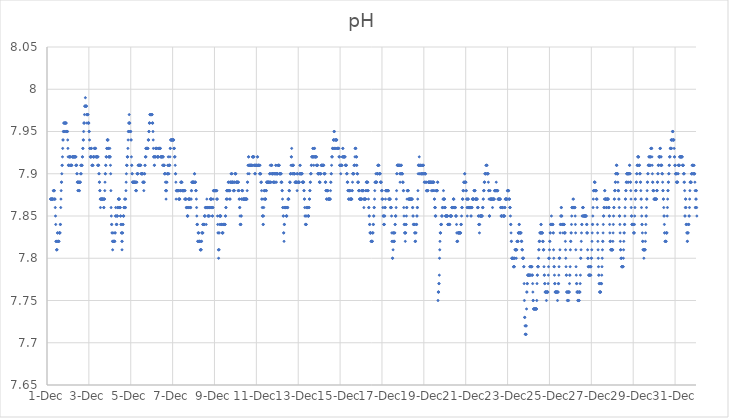
| Category | pH |
|---|---|
| 44896.166666666664 | 7.87 |
| 44896.177083333336 | 7.87 |
| 44896.1875 | 7.87 |
| 44896.197916666664 | 7.87 |
| 44896.208333333336 | 7.87 |
| 44896.21875 | 7.87 |
| 44896.229166666664 | 7.87 |
| 44896.239583333336 | 7.87 |
| 44896.25 | 7.87 |
| 44896.260416666664 | 7.87 |
| 44896.270833333336 | 7.87 |
| 44896.28125 | 7.87 |
| 44896.291666666664 | 7.87 |
| 44896.302083333336 | 7.88 |
| 44896.3125 | 7.88 |
| 44896.322916666664 | 7.88 |
| 44896.333333333336 | 7.87 |
| 44896.34375 | 7.88 |
| 44896.354166666664 | 7.88 |
| 44896.364583333336 | 7.87 |
| 44896.375 | 7.87 |
| 44896.385416666664 | 7.87 |
| 44896.395833333336 | 7.86 |
| 44896.40625 | 7.85 |
| 44896.416666666664 | 7.84 |
| 44896.427083333336 | 7.82 |
| 44896.4375 | 7.82 |
| 44896.447916666664 | 7.82 |
| 44896.458333333336 | 7.81 |
| 44896.46875 | 7.81 |
| 44896.479166666664 | 7.81 |
| 44896.489583333336 | 7.82 |
| 44896.5 | 7.83 |
| 44896.510416666664 | 7.83 |
| 44896.520833333336 | 7.82 |
| 44896.53125 | 7.82 |
| 44896.541666666664 | 7.82 |
| 44896.552083333336 | 7.82 |
| 44896.5625 | 7.82 |
| 44896.572916666664 | 7.82 |
| 44896.583333333336 | 7.83 |
| 44896.59375 | 7.83 |
| 44896.604166666664 | 7.83 |
| 44896.614583333336 | 7.83 |
| 44896.625 | 7.83 |
| 44896.635416666664 | 7.84 |
| 44896.645833333336 | 7.84 |
| 44896.65625 | 7.86 |
| 44896.666666666664 | 7.87 |
| 44896.677083333336 | 7.88 |
| 44896.6875 | 7.89 |
| 44896.697916666664 | 7.89 |
| 44896.708333333336 | 7.9 |
| 44896.71875 | 7.91 |
| 44896.729166666664 | 7.91 |
| 44896.739583333336 | 7.92 |
| 44896.75 | 7.93 |
| 44896.760416666664 | 7.94 |
| 44896.770833333336 | 7.94 |
| 44896.78125 | 7.95 |
| 44896.791666666664 | 7.95 |
| 44896.802083333336 | 7.96 |
| 44896.8125 | 7.96 |
| 44896.822916666664 | 7.96 |
| 44896.833333333336 | 7.96 |
| 44896.84375 | 7.95 |
| 44896.854166666664 | 7.96 |
| 44896.864583333336 | 7.95 |
| 44896.875 | 7.96 |
| 44896.885416666664 | 7.96 |
| 44896.895833333336 | 7.96 |
| 44896.90625 | 7.96 |
| 44896.916666666664 | 7.96 |
| 44896.927083333336 | 7.95 |
| 44896.9375 | 7.95 |
| 44896.947916666664 | 7.95 |
| 44896.958333333336 | 7.95 |
| 44896.96875 | 7.95 |
| 44896.979166666664 | 7.95 |
| 44896.989583333336 | 7.94 |
| 44897.0 | 7.93 |
| 44897.010416666664 | 7.92 |
| 44897.020833333336 | 7.91 |
| 44897.03125 | 7.91 |
| 44897.041666666664 | 7.91 |
| 44897.052083333336 | 7.92 |
| 44897.0625 | 7.91 |
| 44897.072916666664 | 7.92 |
| 44897.083333333336 | 7.92 |
| 44897.09375 | 7.92 |
| 44897.104166666664 | 7.92 |
| 44897.114583333336 | 7.92 |
| 44897.125 | 7.91 |
| 44897.135416666664 | 7.91 |
| 44897.145833333336 | 7.91 |
| 44897.15625 | 7.91 |
| 44897.166666666664 | 7.91 |
| 44897.177083333336 | 7.91 |
| 44897.1875 | 7.91 |
| 44897.197916666664 | 7.92 |
| 44897.208333333336 | 7.92 |
| 44897.21875 | 7.92 |
| 44897.229166666664 | 7.92 |
| 44897.239583333336 | 7.92 |
| 44897.25 | 7.92 |
| 44897.260416666664 | 7.92 |
| 44897.270833333336 | 7.92 |
| 44897.28125 | 7.92 |
| 44897.291666666664 | 7.92 |
| 44897.302083333336 | 7.92 |
| 44897.3125 | 7.92 |
| 44897.322916666664 | 7.92 |
| 44897.333333333336 | 7.92 |
| 44897.34375 | 7.92 |
| 44897.354166666664 | 7.92 |
| 44897.364583333336 | 7.92 |
| 44897.375 | 7.91 |
| 44897.385416666664 | 7.92 |
| 44897.395833333336 | 7.91 |
| 44897.40625 | 7.91 |
| 44897.416666666664 | 7.91 |
| 44897.427083333336 | 7.9 |
| 44897.4375 | 7.9 |
| 44897.447916666664 | 7.89 |
| 44897.458333333336 | 7.89 |
| 44897.46875 | 7.89 |
| 44897.479166666664 | 7.88 |
| 44897.489583333336 | 7.88 |
| 44897.5 | 7.89 |
| 44897.510416666664 | 7.89 |
| 44897.520833333336 | 7.89 |
| 44897.53125 | 7.88 |
| 44897.541666666664 | 7.89 |
| 44897.552083333336 | 7.88 |
| 44897.5625 | 7.89 |
| 44897.572916666664 | 7.89 |
| 44897.583333333336 | 7.89 |
| 44897.59375 | 7.89 |
| 44897.604166666664 | 7.9 |
| 44897.614583333336 | 7.91 |
| 44897.625 | 7.91 |
| 44897.635416666664 | 7.9 |
| 44897.645833333336 | 7.91 |
| 44897.65625 | 7.91 |
| 44897.666666666664 | 7.91 |
| 44897.677083333336 | 7.91 |
| 44897.6875 | 7.92 |
| 44897.697916666664 | 7.92 |
| 44897.708333333336 | 7.93 |
| 44897.71875 | 7.93 |
| 44897.729166666664 | 7.94 |
| 44897.739583333336 | 7.94 |
| 44897.75 | 7.95 |
| 44897.760416666664 | 7.96 |
| 44897.770833333336 | 7.96 |
| 44897.78125 | 7.96 |
| 44897.791666666664 | 7.97 |
| 44897.802083333336 | 7.98 |
| 44897.8125 | 7.98 |
| 44897.822916666664 | 7.98 |
| 44897.833333333336 | 7.99 |
| 44897.84375 | 7.98 |
| 44897.854166666664 | 7.98 |
| 44897.864583333336 | 7.98 |
| 44897.875 | 7.98 |
| 44897.885416666664 | 7.98 |
| 44897.895833333336 | 7.97 |
| 44897.90625 | 7.96 |
| 44897.916666666664 | 7.97 |
| 44897.927083333336 | 7.97 |
| 44897.9375 | 7.97 |
| 44897.947916666664 | 7.97 |
| 44897.958333333336 | 7.97 |
| 44897.96875 | 7.96 |
| 44897.979166666664 | 7.96 |
| 44897.989583333336 | 7.96 |
| 44898.0 | 7.96 |
| 44898.010416666664 | 7.95 |
| 44898.020833333336 | 7.95 |
| 44898.03125 | 7.94 |
| 44898.041666666664 | 7.93 |
| 44898.052083333336 | 7.93 |
| 44898.0625 | 7.92 |
| 44898.072916666664 | 7.92 |
| 44898.083333333336 | 7.92 |
| 44898.09375 | 7.92 |
| 44898.104166666664 | 7.92 |
| 44898.114583333336 | 7.93 |
| 44898.125 | 7.93 |
| 44898.135416666664 | 7.92 |
| 44898.145833333336 | 7.91 |
| 44898.15625 | 7.91 |
| 44898.166666666664 | 7.91 |
| 44898.177083333336 | 7.91 |
| 44898.1875 | 7.91 |
| 44898.197916666664 | 7.91 |
| 44898.208333333336 | 7.92 |
| 44898.21875 | 7.92 |
| 44898.229166666664 | 7.92 |
| 44898.239583333336 | 7.92 |
| 44898.25 | 7.92 |
| 44898.260416666664 | 7.93 |
| 44898.270833333336 | 7.93 |
| 44898.28125 | 7.93 |
| 44898.291666666664 | 7.93 |
| 44898.302083333336 | 7.93 |
| 44898.3125 | 7.93 |
| 44898.322916666664 | 7.93 |
| 44898.333333333336 | 7.92 |
| 44898.34375 | 7.92 |
| 44898.354166666664 | 7.92 |
| 44898.364583333336 | 7.92 |
| 44898.375 | 7.92 |
| 44898.385416666664 | 7.92 |
| 44898.395833333336 | 7.92 |
| 44898.40625 | 7.92 |
| 44898.416666666664 | 7.91 |
| 44898.427083333336 | 7.92 |
| 44898.4375 | 7.92 |
| 44898.447916666664 | 7.91 |
| 44898.458333333336 | 7.91 |
| 44898.46875 | 7.91 |
| 44898.479166666664 | 7.9 |
| 44898.489583333336 | 7.9 |
| 44898.5 | 7.89 |
| 44898.510416666664 | 7.89 |
| 44898.520833333336 | 7.88 |
| 44898.53125 | 7.88 |
| 44898.541666666664 | 7.87 |
| 44898.552083333336 | 7.86 |
| 44898.5625 | 7.87 |
| 44898.572916666664 | 7.87 |
| 44898.583333333336 | 7.87 |
| 44898.59375 | 7.87 |
| 44898.604166666664 | 7.87 |
| 44898.614583333336 | 7.87 |
| 44898.625 | 7.87 |
| 44898.635416666664 | 7.87 |
| 44898.645833333336 | 7.87 |
| 44898.65625 | 7.87 |
| 44898.666666666664 | 7.87 |
| 44898.677083333336 | 7.87 |
| 44898.6875 | 7.87 |
| 44898.697916666664 | 7.87 |
| 44898.708333333336 | 7.86 |
| 44898.71875 | 7.86 |
| 44898.729166666664 | 7.87 |
| 44898.739583333336 | 7.87 |
| 44898.75 | 7.87 |
| 44898.760416666664 | 7.88 |
| 44898.770833333336 | 7.89 |
| 44898.78125 | 7.9 |
| 44898.791666666664 | 7.9 |
| 44898.802083333336 | 7.91 |
| 44898.8125 | 7.91 |
| 44898.822916666664 | 7.92 |
| 44898.833333333336 | 7.92 |
| 44898.84375 | 7.92 |
| 44898.854166666664 | 7.93 |
| 44898.864583333336 | 7.93 |
| 44898.875 | 7.94 |
| 44898.885416666664 | 7.94 |
| 44898.895833333336 | 7.94 |
| 44898.90625 | 7.94 |
| 44898.916666666664 | 7.94 |
| 44898.927083333336 | 7.93 |
| 44898.9375 | 7.93 |
| 44898.947916666664 | 7.92 |
| 44898.958333333336 | 7.92 |
| 44898.96875 | 7.92 |
| 44898.979166666664 | 7.92 |
| 44898.989583333336 | 7.92 |
| 44899.0 | 7.93 |
| 44899.010416666664 | 7.92 |
| 44899.020833333336 | 7.92 |
| 44899.03125 | 7.91 |
| 44899.041666666664 | 7.9 |
| 44899.052083333336 | 7.88 |
| 44899.0625 | 7.86 |
| 44899.072916666664 | 7.85 |
| 44899.083333333336 | 7.84 |
| 44899.09375 | 7.84 |
| 44899.104166666664 | 7.83 |
| 44899.114583333336 | 7.83 |
| 44899.125 | 7.82 |
| 44899.135416666664 | 7.81 |
| 44899.145833333336 | 7.82 |
| 44899.15625 | 7.82 |
| 44899.166666666664 | 7.82 |
| 44899.177083333336 | 7.82 |
| 44899.1875 | 7.82 |
| 44899.197916666664 | 7.83 |
| 44899.208333333336 | 7.82 |
| 44899.21875 | 7.82 |
| 44899.229166666664 | 7.82 |
| 44899.239583333336 | 7.82 |
| 44899.25 | 7.83 |
| 44899.260416666664 | 7.83 |
| 44899.270833333336 | 7.85 |
| 44899.28125 | 7.86 |
| 44899.291666666664 | 7.85 |
| 44899.302083333336 | 7.85 |
| 44899.3125 | 7.84 |
| 44899.322916666664 | 7.84 |
| 44899.333333333336 | 7.84 |
| 44899.34375 | 7.85 |
| 44899.354166666664 | 7.85 |
| 44899.364583333336 | 7.85 |
| 44899.375 | 7.86 |
| 44899.385416666664 | 7.86 |
| 44899.395833333336 | 7.86 |
| 44899.40625 | 7.87 |
| 44899.416666666664 | 7.87 |
| 44899.427083333336 | 7.87 |
| 44899.4375 | 7.87 |
| 44899.447916666664 | 7.87 |
| 44899.458333333336 | 7.87 |
| 44899.46875 | 7.86 |
| 44899.479166666664 | 7.86 |
| 44899.489583333336 | 7.86 |
| 44899.5 | 7.86 |
| 44899.510416666664 | 7.85 |
| 44899.520833333336 | 7.85 |
| 44899.53125 | 7.84 |
| 44899.541666666664 | 7.84 |
| 44899.552083333336 | 7.83 |
| 44899.5625 | 7.83 |
| 44899.572916666664 | 7.82 |
| 44899.583333333336 | 7.81 |
| 44899.59375 | 7.82 |
| 44899.604166666664 | 7.83 |
| 44899.614583333336 | 7.83 |
| 44899.625 | 7.84 |
| 44899.635416666664 | 7.84 |
| 44899.645833333336 | 7.85 |
| 44899.65625 | 7.85 |
| 44899.666666666664 | 7.85 |
| 44899.677083333336 | 7.86 |
| 44899.6875 | 7.86 |
| 44899.697916666664 | 7.86 |
| 44899.708333333336 | 7.87 |
| 44899.71875 | 7.86 |
| 44899.729166666664 | 7.87 |
| 44899.739583333336 | 7.86 |
| 44899.75 | 7.86 |
| 44899.760416666664 | 7.87 |
| 44899.770833333336 | 7.88 |
| 44899.78125 | 7.89 |
| 44899.791666666664 | 7.9 |
| 44899.802083333336 | 7.91 |
| 44899.8125 | 7.91 |
| 44899.822916666664 | 7.91 |
| 44899.833333333336 | 7.92 |
| 44899.84375 | 7.92 |
| 44899.854166666664 | 7.92 |
| 44899.864583333336 | 7.93 |
| 44899.875 | 7.94 |
| 44899.885416666664 | 7.95 |
| 44899.895833333336 | 7.95 |
| 44899.90625 | 7.96 |
| 44899.916666666664 | 7.96 |
| 44899.927083333336 | 7.97 |
| 44899.9375 | 7.96 |
| 44899.947916666664 | 7.96 |
| 44899.958333333336 | 7.96 |
| 44899.96875 | 7.95 |
| 44899.979166666664 | 7.95 |
| 44899.989583333336 | 7.95 |
| 44900.0 | 7.95 |
| 44900.010416666664 | 7.94 |
| 44900.020833333336 | 7.94 |
| 44900.03125 | 7.92 |
| 44900.041666666664 | 7.91 |
| 44900.052083333336 | 7.91 |
| 44900.0625 | 7.9 |
| 44900.072916666664 | 7.9 |
| 44900.083333333336 | 7.89 |
| 44900.09375 | 7.89 |
| 44900.104166666664 | 7.89 |
| 44900.114583333336 | 7.89 |
| 44900.125 | 7.89 |
| 44900.135416666664 | 7.89 |
| 44900.145833333336 | 7.89 |
| 44900.15625 | 7.89 |
| 44900.166666666664 | 7.89 |
| 44900.177083333336 | 7.89 |
| 44900.1875 | 7.89 |
| 44900.197916666664 | 7.89 |
| 44900.208333333336 | 7.89 |
| 44900.21875 | 7.89 |
| 44900.229166666664 | 7.89 |
| 44900.239583333336 | 7.88 |
| 44900.25 | 7.88 |
| 44900.260416666664 | 7.88 |
| 44900.270833333336 | 7.88 |
| 44900.28125 | 7.89 |
| 44900.291666666664 | 7.89 |
| 44900.302083333336 | 7.9 |
| 44900.3125 | 7.9 |
| 44900.322916666664 | 7.9 |
| 44900.333333333336 | 7.9 |
| 44900.34375 | 7.9 |
| 44900.354166666664 | 7.91 |
| 44900.364583333336 | 7.91 |
| 44900.375 | 7.91 |
| 44900.385416666664 | 7.91 |
| 44900.395833333336 | 7.91 |
| 44900.40625 | 7.91 |
| 44900.416666666664 | 7.91 |
| 44900.427083333336 | 7.91 |
| 44900.4375 | 7.91 |
| 44900.447916666664 | 7.91 |
| 44900.458333333336 | 7.91 |
| 44900.46875 | 7.91 |
| 44900.479166666664 | 7.91 |
| 44900.489583333336 | 7.9 |
| 44900.5 | 7.9 |
| 44900.510416666664 | 7.9 |
| 44900.520833333336 | 7.9 |
| 44900.53125 | 7.9 |
| 44900.541666666664 | 7.9 |
| 44900.552083333336 | 7.9 |
| 44900.5625 | 7.9 |
| 44900.572916666664 | 7.89 |
| 44900.583333333336 | 7.9 |
| 44900.59375 | 7.89 |
| 44900.604166666664 | 7.89 |
| 44900.614583333336 | 7.89 |
| 44900.625 | 7.88 |
| 44900.635416666664 | 7.89 |
| 44900.645833333336 | 7.89 |
| 44900.65625 | 7.9 |
| 44900.666666666664 | 7.9 |
| 44900.677083333336 | 7.91 |
| 44900.6875 | 7.91 |
| 44900.697916666664 | 7.92 |
| 44900.708333333336 | 7.92 |
| 44900.71875 | 7.93 |
| 44900.729166666664 | 7.92 |
| 44900.739583333336 | 7.93 |
| 44900.75 | 7.93 |
| 44900.760416666664 | 7.93 |
| 44900.770833333336 | 7.93 |
| 44900.78125 | 7.93 |
| 44900.791666666664 | 7.93 |
| 44900.802083333336 | 7.93 |
| 44900.8125 | 7.93 |
| 44900.822916666664 | 7.93 |
| 44900.833333333336 | 7.94 |
| 44900.84375 | 7.94 |
| 44900.854166666664 | 7.94 |
| 44900.864583333336 | 7.95 |
| 44900.875 | 7.95 |
| 44900.885416666664 | 7.96 |
| 44900.895833333336 | 7.96 |
| 44900.90625 | 7.96 |
| 44900.916666666664 | 7.97 |
| 44900.927083333336 | 7.97 |
| 44900.9375 | 7.97 |
| 44900.947916666664 | 7.97 |
| 44900.958333333336 | 7.97 |
| 44900.96875 | 7.97 |
| 44900.979166666664 | 7.97 |
| 44900.989583333336 | 7.97 |
| 44901.0 | 7.97 |
| 44901.010416666664 | 7.97 |
| 44901.020833333336 | 7.97 |
| 44901.03125 | 7.96 |
| 44901.041666666664 | 7.96 |
| 44901.052083333336 | 7.96 |
| 44901.0625 | 7.95 |
| 44901.072916666664 | 7.94 |
| 44901.083333333336 | 7.93 |
| 44901.09375 | 7.92 |
| 44901.104166666664 | 7.92 |
| 44901.114583333336 | 7.92 |
| 44901.125 | 7.91 |
| 44901.135416666664 | 7.91 |
| 44901.145833333336 | 7.92 |
| 44901.15625 | 7.92 |
| 44901.166666666664 | 7.92 |
| 44901.177083333336 | 7.92 |
| 44901.1875 | 7.93 |
| 44901.197916666664 | 7.93 |
| 44901.208333333336 | 7.93 |
| 44901.21875 | 7.93 |
| 44901.229166666664 | 7.93 |
| 44901.239583333336 | 7.93 |
| 44901.25 | 7.93 |
| 44901.260416666664 | 7.92 |
| 44901.270833333336 | 7.92 |
| 44901.28125 | 7.92 |
| 44901.291666666664 | 7.92 |
| 44901.302083333336 | 7.92 |
| 44901.3125 | 7.92 |
| 44901.322916666664 | 7.92 |
| 44901.333333333336 | 7.93 |
| 44901.34375 | 7.93 |
| 44901.354166666664 | 7.93 |
| 44901.364583333336 | 7.93 |
| 44901.375 | 7.93 |
| 44901.385416666664 | 7.93 |
| 44901.395833333336 | 7.93 |
| 44901.40625 | 7.93 |
| 44901.416666666664 | 7.93 |
| 44901.427083333336 | 7.92 |
| 44901.4375 | 7.92 |
| 44901.447916666664 | 7.92 |
| 44901.458333333336 | 7.92 |
| 44901.46875 | 7.92 |
| 44901.479166666664 | 7.92 |
| 44901.489583333336 | 7.92 |
| 44901.5 | 7.92 |
| 44901.510416666664 | 7.92 |
| 44901.520833333336 | 7.91 |
| 44901.53125 | 7.92 |
| 44901.541666666664 | 7.92 |
| 44901.552083333336 | 7.92 |
| 44901.5625 | 7.91 |
| 44901.572916666664 | 7.91 |
| 44901.583333333336 | 7.91 |
| 44901.59375 | 7.91 |
| 44901.604166666664 | 7.91 |
| 44901.614583333336 | 7.9 |
| 44901.625 | 7.9 |
| 44901.635416666664 | 7.9 |
| 44901.645833333336 | 7.9 |
| 44901.65625 | 7.89 |
| 44901.666666666664 | 7.88 |
| 44901.677083333336 | 7.88 |
| 44901.6875 | 7.87 |
| 44901.697916666664 | 7.88 |
| 44901.708333333336 | 7.88 |
| 44901.71875 | 7.89 |
| 44901.729166666664 | 7.89 |
| 44901.739583333336 | 7.9 |
| 44901.75 | 7.9 |
| 44901.760416666664 | 7.9 |
| 44901.770833333336 | 7.91 |
| 44901.78125 | 7.91 |
| 44901.791666666664 | 7.92 |
| 44901.802083333336 | 7.9 |
| 44901.8125 | 7.91 |
| 44901.822916666664 | 7.9 |
| 44901.833333333336 | 7.91 |
| 44901.84375 | 7.91 |
| 44901.854166666664 | 7.91 |
| 44901.864583333336 | 7.91 |
| 44901.875 | 7.92 |
| 44901.885416666664 | 7.93 |
| 44901.895833333336 | 7.93 |
| 44901.90625 | 7.94 |
| 44901.916666666664 | 7.94 |
| 44901.927083333336 | 7.94 |
| 44901.9375 | 7.94 |
| 44901.947916666664 | 7.94 |
| 44901.958333333336 | 7.94 |
| 44901.96875 | 7.94 |
| 44901.979166666664 | 7.94 |
| 44901.989583333336 | 7.94 |
| 44902.0 | 7.94 |
| 44902.010416666664 | 7.94 |
| 44902.020833333336 | 7.94 |
| 44902.03125 | 7.94 |
| 44902.041666666664 | 7.94 |
| 44902.052083333336 | 7.94 |
| 44902.0625 | 7.93 |
| 44902.072916666664 | 7.93 |
| 44902.083333333336 | 7.93 |
| 44902.09375 | 7.92 |
| 44902.104166666664 | 7.92 |
| 44902.114583333336 | 7.92 |
| 44902.125 | 7.91 |
| 44902.135416666664 | 7.9 |
| 44902.145833333336 | 7.9 |
| 44902.15625 | 7.89 |
| 44902.166666666664 | 7.87 |
| 44902.177083333336 | 7.88 |
| 44902.1875 | 7.88 |
| 44902.197916666664 | 7.88 |
| 44902.208333333336 | 7.88 |
| 44902.21875 | 7.88 |
| 44902.229166666664 | 7.88 |
| 44902.239583333336 | 7.88 |
| 44902.25 | 7.88 |
| 44902.260416666664 | 7.88 |
| 44902.270833333336 | 7.88 |
| 44902.28125 | 7.88 |
| 44902.291666666664 | 7.87 |
| 44902.302083333336 | 7.87 |
| 44902.3125 | 7.87 |
| 44902.322916666664 | 7.87 |
| 44902.333333333336 | 7.87 |
| 44902.34375 | 7.87 |
| 44902.354166666664 | 7.88 |
| 44902.364583333336 | 7.88 |
| 44902.375 | 7.88 |
| 44902.385416666664 | 7.89 |
| 44902.395833333336 | 7.88 |
| 44902.40625 | 7.89 |
| 44902.416666666664 | 7.89 |
| 44902.427083333336 | 7.89 |
| 44902.4375 | 7.89 |
| 44902.447916666664 | 7.89 |
| 44902.458333333336 | 7.88 |
| 44902.46875 | 7.88 |
| 44902.479166666664 | 7.88 |
| 44902.489583333336 | 7.88 |
| 44902.5 | 7.88 |
| 44902.510416666664 | 7.88 |
| 44902.520833333336 | 7.88 |
| 44902.53125 | 7.88 |
| 44902.541666666664 | 7.88 |
| 44902.552083333336 | 7.88 |
| 44902.5625 | 7.88 |
| 44902.572916666664 | 7.87 |
| 44902.583333333336 | 7.88 |
| 44902.59375 | 7.88 |
| 44902.604166666664 | 7.87 |
| 44902.614583333336 | 7.87 |
| 44902.625 | 7.87 |
| 44902.635416666664 | 7.87 |
| 44902.645833333336 | 7.87 |
| 44902.65625 | 7.86 |
| 44902.666666666664 | 7.86 |
| 44902.677083333336 | 7.86 |
| 44902.6875 | 7.86 |
| 44902.697916666664 | 7.85 |
| 44902.708333333336 | 7.85 |
| 44902.71875 | 7.85 |
| 44902.729166666664 | 7.85 |
| 44902.739583333336 | 7.86 |
| 44902.75 | 7.87 |
| 44902.760416666664 | 7.86 |
| 44902.770833333336 | 7.87 |
| 44902.78125 | 7.87 |
| 44902.791666666664 | 7.87 |
| 44902.802083333336 | 7.87 |
| 44902.8125 | 7.87 |
| 44902.822916666664 | 7.87 |
| 44902.833333333336 | 7.86 |
| 44902.84375 | 7.86 |
| 44902.854166666664 | 7.86 |
| 44902.864583333336 | 7.86 |
| 44902.875 | 7.87 |
| 44902.885416666664 | 7.87 |
| 44902.895833333336 | 7.88 |
| 44902.90625 | 7.88 |
| 44902.916666666664 | 7.89 |
| 44902.927083333336 | 7.89 |
| 44902.9375 | 7.89 |
| 44902.947916666664 | 7.89 |
| 44902.958333333336 | 7.89 |
| 44902.96875 | 7.89 |
| 44902.979166666664 | 7.89 |
| 44902.989583333336 | 7.89 |
| 44903.0 | 7.89 |
| 44903.010416666664 | 7.89 |
| 44903.020833333336 | 7.89 |
| 44903.03125 | 7.89 |
| 44903.041666666664 | 7.9 |
| 44903.052083333336 | 7.9 |
| 44903.0625 | 7.89 |
| 44903.072916666664 | 7.89 |
| 44903.083333333336 | 7.89 |
| 44903.09375 | 7.89 |
| 44903.104166666664 | 7.88 |
| 44903.114583333336 | 7.88 |
| 44903.125 | 7.88 |
| 44903.135416666664 | 7.87 |
| 44903.145833333336 | 7.86 |
| 44903.15625 | 7.85 |
| 44903.166666666664 | 7.84 |
| 44903.177083333336 | 7.84 |
| 44903.1875 | 7.84 |
| 44903.197916666664 | 7.82 |
| 44903.208333333336 | 7.82 |
| 44903.21875 | 7.83 |
| 44903.229166666664 | 7.83 |
| 44903.239583333336 | 7.82 |
| 44903.25 | 7.83 |
| 44903.260416666664 | 7.82 |
| 44903.270833333336 | 7.82 |
| 44903.28125 | 7.82 |
| 44903.291666666664 | 7.82 |
| 44903.302083333336 | 7.82 |
| 44903.3125 | 7.82 |
| 44903.322916666664 | 7.81 |
| 44903.333333333336 | 7.81 |
| 44903.34375 | 7.81 |
| 44903.354166666664 | 7.81 |
| 44903.364583333336 | 7.81 |
| 44903.375 | 7.82 |
| 44903.385416666664 | 7.82 |
| 44903.395833333336 | 7.83 |
| 44903.40625 | 7.83 |
| 44903.416666666664 | 7.83 |
| 44903.427083333336 | 7.83 |
| 44903.4375 | 7.84 |
| 44903.447916666664 | 7.83 |
| 44903.458333333336 | 7.84 |
| 44903.46875 | 7.84 |
| 44903.479166666664 | 7.84 |
| 44903.489583333336 | 7.84 |
| 44903.5 | 7.84 |
| 44903.510416666664 | 7.84 |
| 44903.520833333336 | 7.85 |
| 44903.53125 | 7.85 |
| 44903.541666666664 | 7.85 |
| 44903.552083333336 | 7.85 |
| 44903.5625 | 7.86 |
| 44903.572916666664 | 7.86 |
| 44903.583333333336 | 7.86 |
| 44903.59375 | 7.86 |
| 44903.604166666664 | 7.84 |
| 44903.614583333336 | 7.86 |
| 44903.625 | 7.86 |
| 44903.635416666664 | 7.87 |
| 44903.645833333336 | 7.86 |
| 44903.65625 | 7.86 |
| 44903.666666666664 | 7.86 |
| 44903.677083333336 | 7.86 |
| 44903.6875 | 7.85 |
| 44903.697916666664 | 7.85 |
| 44903.708333333336 | 7.85 |
| 44903.71875 | 7.86 |
| 44903.729166666664 | 7.85 |
| 44903.739583333336 | 7.86 |
| 44903.75 | 7.86 |
| 44903.760416666664 | 7.85 |
| 44903.770833333336 | 7.86 |
| 44903.78125 | 7.86 |
| 44903.791666666664 | 7.86 |
| 44903.802083333336 | 7.87 |
| 44903.8125 | 7.87 |
| 44903.822916666664 | 7.87 |
| 44903.833333333336 | 7.87 |
| 44903.84375 | 7.87 |
| 44903.854166666664 | 7.87 |
| 44903.864583333336 | 7.86 |
| 44903.875 | 7.86 |
| 44903.885416666664 | 7.86 |
| 44903.895833333336 | 7.85 |
| 44903.90625 | 7.85 |
| 44903.916666666664 | 7.86 |
| 44903.927083333336 | 7.86 |
| 44903.9375 | 7.87 |
| 44903.947916666664 | 7.88 |
| 44903.958333333336 | 7.88 |
| 44903.96875 | 7.88 |
| 44903.979166666664 | 7.88 |
| 44903.989583333336 | 7.88 |
| 44904.0 | 7.88 |
| 44904.010416666664 | 7.88 |
| 44904.020833333336 | 7.88 |
| 44904.03125 | 7.88 |
| 44904.041666666664 | 7.88 |
| 44904.052083333336 | 7.88 |
| 44904.0625 | 7.88 |
| 44904.072916666664 | 7.88 |
| 44904.083333333336 | 7.88 |
| 44904.09375 | 7.88 |
| 44904.104166666664 | 7.87 |
| 44904.114583333336 | 7.88 |
| 44904.125 | 7.87 |
| 44904.135416666664 | 7.87 |
| 44904.145833333336 | 7.85 |
| 44904.15625 | 7.84 |
| 44904.166666666664 | 7.83 |
| 44904.177083333336 | 7.83 |
| 44904.1875 | 7.81 |
| 44904.197916666664 | 7.8 |
| 44904.208333333336 | 7.81 |
| 44904.21875 | 7.81 |
| 44904.229166666664 | 7.83 |
| 44904.239583333336 | 7.85 |
| 44904.25 | 7.84 |
| 44904.260416666664 | 7.85 |
| 44904.270833333336 | 7.85 |
| 44904.28125 | 7.85 |
| 44904.291666666664 | 7.85 |
| 44904.302083333336 | 7.85 |
| 44904.3125 | 7.84 |
| 44904.322916666664 | 7.84 |
| 44904.333333333336 | 7.84 |
| 44904.34375 | 7.84 |
| 44904.354166666664 | 7.84 |
| 44904.364583333336 | 7.83 |
| 44904.375 | 7.83 |
| 44904.385416666664 | 7.83 |
| 44904.395833333336 | 7.83 |
| 44904.40625 | 7.83 |
| 44904.416666666664 | 7.84 |
| 44904.427083333336 | 7.84 |
| 44904.4375 | 7.84 |
| 44904.447916666664 | 7.84 |
| 44904.458333333336 | 7.84 |
| 44904.46875 | 7.84 |
| 44904.479166666664 | 7.84 |
| 44904.489583333336 | 7.84 |
| 44904.5 | 7.84 |
| 44904.510416666664 | 7.84 |
| 44904.520833333336 | 7.85 |
| 44904.53125 | 7.85 |
| 44904.541666666664 | 7.86 |
| 44904.552083333336 | 7.86 |
| 44904.5625 | 7.87 |
| 44904.572916666664 | 7.87 |
| 44904.583333333336 | 7.88 |
| 44904.59375 | 7.88 |
| 44904.604166666664 | 7.88 |
| 44904.614583333336 | 7.88 |
| 44904.625 | 7.87 |
| 44904.635416666664 | 7.88 |
| 44904.645833333336 | 7.88 |
| 44904.65625 | 7.89 |
| 44904.666666666664 | 7.89 |
| 44904.677083333336 | 7.88 |
| 44904.6875 | 7.88 |
| 44904.697916666664 | 7.89 |
| 44904.708333333336 | 7.88 |
| 44904.71875 | 7.88 |
| 44904.729166666664 | 7.87 |
| 44904.739583333336 | 7.88 |
| 44904.75 | 7.87 |
| 44904.760416666664 | 7.89 |
| 44904.770833333336 | 7.89 |
| 44904.78125 | 7.89 |
| 44904.791666666664 | 7.9 |
| 44904.802083333336 | 7.89 |
| 44904.8125 | 7.89 |
| 44904.822916666664 | 7.9 |
| 44904.833333333336 | 7.9 |
| 44904.84375 | 7.89 |
| 44904.854166666664 | 7.89 |
| 44904.864583333336 | 7.89 |
| 44904.875 | 7.89 |
| 44904.885416666664 | 7.89 |
| 44904.895833333336 | 7.89 |
| 44904.90625 | 7.88 |
| 44904.916666666664 | 7.88 |
| 44904.927083333336 | 7.88 |
| 44904.9375 | 7.88 |
| 44904.947916666664 | 7.88 |
| 44904.958333333336 | 7.89 |
| 44904.96875 | 7.89 |
| 44904.979166666664 | 7.9 |
| 44904.989583333336 | 7.9 |
| 44905.0 | 7.9 |
| 44905.010416666664 | 7.9 |
| 44905.020833333336 | 7.9 |
| 44905.03125 | 7.89 |
| 44905.041666666664 | 7.89 |
| 44905.052083333336 | 7.89 |
| 44905.0625 | 7.89 |
| 44905.072916666664 | 7.89 |
| 44905.083333333336 | 7.89 |
| 44905.09375 | 7.89 |
| 44905.104166666664 | 7.89 |
| 44905.114583333336 | 7.89 |
| 44905.125 | 7.88 |
| 44905.135416666664 | 7.89 |
| 44905.145833333336 | 7.89 |
| 44905.15625 | 7.88 |
| 44905.166666666664 | 7.88 |
| 44905.177083333336 | 7.87 |
| 44905.1875 | 7.87 |
| 44905.197916666664 | 7.86 |
| 44905.208333333336 | 7.86 |
| 44905.21875 | 7.85 |
| 44905.229166666664 | 7.84 |
| 44905.239583333336 | 7.84 |
| 44905.25 | 7.84 |
| 44905.260416666664 | 7.84 |
| 44905.270833333336 | 7.85 |
| 44905.28125 | 7.85 |
| 44905.291666666664 | 7.87 |
| 44905.302083333336 | 7.87 |
| 44905.3125 | 7.88 |
| 44905.322916666664 | 7.88 |
| 44905.333333333336 | 7.88 |
| 44905.34375 | 7.88 |
| 44905.354166666664 | 7.87 |
| 44905.364583333336 | 7.87 |
| 44905.375 | 7.87 |
| 44905.385416666664 | 7.87 |
| 44905.395833333336 | 7.87 |
| 44905.40625 | 7.87 |
| 44905.416666666664 | 7.87 |
| 44905.427083333336 | 7.87 |
| 44905.4375 | 7.87 |
| 44905.447916666664 | 7.87 |
| 44905.458333333336 | 7.87 |
| 44905.46875 | 7.87 |
| 44905.479166666664 | 7.87 |
| 44905.489583333336 | 7.87 |
| 44905.5 | 7.87 |
| 44905.510416666664 | 7.87 |
| 44905.520833333336 | 7.87 |
| 44905.53125 | 7.87 |
| 44905.541666666664 | 7.87 |
| 44905.552083333336 | 7.87 |
| 44905.5625 | 7.88 |
| 44905.572916666664 | 7.89 |
| 44905.583333333336 | 7.89 |
| 44905.59375 | 7.9 |
| 44905.604166666664 | 7.91 |
| 44905.614583333336 | 7.91 |
| 44905.625 | 7.92 |
| 44905.635416666664 | 7.92 |
| 44905.645833333336 | 7.91 |
| 44905.65625 | 7.9 |
| 44905.666666666664 | 7.91 |
| 44905.677083333336 | 7.91 |
| 44905.6875 | 7.91 |
| 44905.697916666664 | 7.91 |
| 44905.708333333336 | 7.91 |
| 44905.71875 | 7.91 |
| 44905.729166666664 | 7.91 |
| 44905.739583333336 | 7.91 |
| 44905.75 | 7.91 |
| 44905.760416666664 | 7.91 |
| 44905.770833333336 | 7.91 |
| 44905.78125 | 7.91 |
| 44905.791666666664 | 7.91 |
| 44905.802083333336 | 7.91 |
| 44905.8125 | 7.92 |
| 44905.822916666664 | 7.92 |
| 44905.833333333336 | 7.92 |
| 44905.84375 | 7.91 |
| 44905.854166666664 | 7.92 |
| 44905.864583333336 | 7.92 |
| 44905.875 | 7.92 |
| 44905.885416666664 | 7.92 |
| 44905.895833333336 | 7.91 |
| 44905.90625 | 7.91 |
| 44905.916666666664 | 7.91 |
| 44905.927083333336 | 7.9 |
| 44905.9375 | 7.9 |
| 44905.947916666664 | 7.9 |
| 44905.958333333336 | 7.91 |
| 44905.96875 | 7.91 |
| 44905.979166666664 | 7.91 |
| 44905.989583333336 | 7.91 |
| 44906.0 | 7.91 |
| 44906.010416666664 | 7.91 |
| 44906.020833333336 | 7.91 |
| 44906.03125 | 7.91 |
| 44906.041666666664 | 7.91 |
| 44906.052083333336 | 7.92 |
| 44906.0625 | 7.92 |
| 44906.072916666664 | 7.91 |
| 44906.083333333336 | 7.91 |
| 44906.09375 | 7.91 |
| 44906.104166666664 | 7.91 |
| 44906.114583333336 | 7.91 |
| 44906.125 | 7.91 |
| 44906.135416666664 | 7.91 |
| 44906.145833333336 | 7.91 |
| 44906.15625 | 7.9 |
| 44906.166666666664 | 7.9 |
| 44906.177083333336 | 7.91 |
| 44906.1875 | 7.9 |
| 44906.197916666664 | 7.9 |
| 44906.208333333336 | 7.9 |
| 44906.21875 | 7.89 |
| 44906.229166666664 | 7.89 |
| 44906.239583333336 | 7.89 |
| 44906.25 | 7.88 |
| 44906.260416666664 | 7.87 |
| 44906.270833333336 | 7.87 |
| 44906.28125 | 7.86 |
| 44906.291666666664 | 7.85 |
| 44906.302083333336 | 7.85 |
| 44906.3125 | 7.85 |
| 44906.322916666664 | 7.84 |
| 44906.333333333336 | 7.84 |
| 44906.34375 | 7.85 |
| 44906.354166666664 | 7.86 |
| 44906.364583333336 | 7.87 |
| 44906.375 | 7.88 |
| 44906.385416666664 | 7.88 |
| 44906.395833333336 | 7.88 |
| 44906.40625 | 7.87 |
| 44906.416666666664 | 7.87 |
| 44906.427083333336 | 7.87 |
| 44906.4375 | 7.87 |
| 44906.447916666664 | 7.87 |
| 44906.458333333336 | 7.88 |
| 44906.46875 | 7.88 |
| 44906.479166666664 | 7.88 |
| 44906.489583333336 | 7.89 |
| 44906.5 | 7.89 |
| 44906.510416666664 | 7.89 |
| 44906.520833333336 | 7.89 |
| 44906.53125 | 7.89 |
| 44906.541666666664 | 7.89 |
| 44906.552083333336 | 7.89 |
| 44906.5625 | 7.89 |
| 44906.572916666664 | 7.89 |
| 44906.583333333336 | 7.89 |
| 44906.59375 | 7.89 |
| 44906.604166666664 | 7.89 |
| 44906.614583333336 | 7.89 |
| 44906.625 | 7.89 |
| 44906.635416666664 | 7.9 |
| 44906.645833333336 | 7.9 |
| 44906.65625 | 7.9 |
| 44906.666666666664 | 7.91 |
| 44906.677083333336 | 7.89 |
| 44906.6875 | 7.89 |
| 44906.697916666664 | 7.89 |
| 44906.708333333336 | 7.9 |
| 44906.71875 | 7.91 |
| 44906.729166666664 | 7.91 |
| 44906.739583333336 | 7.91 |
| 44906.75 | 7.9 |
| 44906.760416666664 | 7.9 |
| 44906.770833333336 | 7.9 |
| 44906.78125 | 7.9 |
| 44906.791666666664 | 7.9 |
| 44906.802083333336 | 7.89 |
| 44906.8125 | 7.89 |
| 44906.822916666664 | 7.89 |
| 44906.833333333336 | 7.9 |
| 44906.84375 | 7.9 |
| 44906.854166666664 | 7.9 |
| 44906.864583333336 | 7.89 |
| 44906.875 | 7.9 |
| 44906.885416666664 | 7.89 |
| 44906.895833333336 | 7.89 |
| 44906.90625 | 7.9 |
| 44906.916666666664 | 7.9 |
| 44906.927083333336 | 7.91 |
| 44906.9375 | 7.91 |
| 44906.947916666664 | 7.9 |
| 44906.958333333336 | 7.89 |
| 44906.96875 | 7.9 |
| 44906.979166666664 | 7.9 |
| 44906.989583333336 | 7.9 |
| 44907.0 | 7.9 |
| 44907.010416666664 | 7.9 |
| 44907.020833333336 | 7.9 |
| 44907.03125 | 7.91 |
| 44907.041666666664 | 7.91 |
| 44907.052083333336 | 7.91 |
| 44907.0625 | 7.91 |
| 44907.072916666664 | 7.91 |
| 44907.083333333336 | 7.91 |
| 44907.09375 | 7.91 |
| 44907.104166666664 | 7.9 |
| 44907.114583333336 | 7.9 |
| 44907.125 | 7.9 |
| 44907.135416666664 | 7.9 |
| 44907.145833333336 | 7.9 |
| 44907.15625 | 7.9 |
| 44907.166666666664 | 7.9 |
| 44907.177083333336 | 7.89 |
| 44907.1875 | 7.9 |
| 44907.197916666664 | 7.89 |
| 44907.208333333336 | 7.89 |
| 44907.21875 | 7.89 |
| 44907.229166666664 | 7.88 |
| 44907.239583333336 | 7.88 |
| 44907.25 | 7.87 |
| 44907.260416666664 | 7.86 |
| 44907.270833333336 | 7.86 |
| 44907.28125 | 7.85 |
| 44907.291666666664 | 7.85 |
| 44907.302083333336 | 7.83 |
| 44907.3125 | 7.83 |
| 44907.322916666664 | 7.82 |
| 44907.333333333336 | 7.84 |
| 44907.34375 | 7.84 |
| 44907.354166666664 | 7.86 |
| 44907.364583333336 | 7.86 |
| 44907.375 | 7.86 |
| 44907.385416666664 | 7.86 |
| 44907.395833333336 | 7.86 |
| 44907.40625 | 7.86 |
| 44907.416666666664 | 7.86 |
| 44907.427083333336 | 7.85 |
| 44907.4375 | 7.85 |
| 44907.447916666664 | 7.85 |
| 44907.458333333336 | 7.85 |
| 44907.46875 | 7.86 |
| 44907.479166666664 | 7.86 |
| 44907.489583333336 | 7.86 |
| 44907.5 | 7.86 |
| 44907.510416666664 | 7.87 |
| 44907.520833333336 | 7.87 |
| 44907.53125 | 7.87 |
| 44907.541666666664 | 7.87 |
| 44907.552083333336 | 7.87 |
| 44907.5625 | 7.88 |
| 44907.572916666664 | 7.88 |
| 44907.583333333336 | 7.88 |
| 44907.59375 | 7.89 |
| 44907.604166666664 | 7.89 |
| 44907.614583333336 | 7.89 |
| 44907.625 | 7.9 |
| 44907.635416666664 | 7.9 |
| 44907.645833333336 | 7.9 |
| 44907.65625 | 7.91 |
| 44907.666666666664 | 7.92 |
| 44907.677083333336 | 7.92 |
| 44907.6875 | 7.93 |
| 44907.697916666664 | 7.91 |
| 44907.708333333336 | 7.9 |
| 44907.71875 | 7.9 |
| 44907.729166666664 | 7.91 |
| 44907.739583333336 | 7.91 |
| 44907.75 | 7.91 |
| 44907.760416666664 | 7.91 |
| 44907.770833333336 | 7.91 |
| 44907.78125 | 7.9 |
| 44907.791666666664 | 7.9 |
| 44907.802083333336 | 7.9 |
| 44907.8125 | 7.9 |
| 44907.822916666664 | 7.9 |
| 44907.833333333336 | 7.9 |
| 44907.84375 | 7.89 |
| 44907.854166666664 | 7.89 |
| 44907.864583333336 | 7.89 |
| 44907.875 | 7.89 |
| 44907.885416666664 | 7.89 |
| 44907.895833333336 | 7.89 |
| 44907.90625 | 7.89 |
| 44907.916666666664 | 7.89 |
| 44907.927083333336 | 7.89 |
| 44907.9375 | 7.9 |
| 44907.947916666664 | 7.88 |
| 44907.958333333336 | 7.9 |
| 44907.96875 | 7.9 |
| 44907.979166666664 | 7.89 |
| 44907.989583333336 | 7.89 |
| 44908.0 | 7.89 |
| 44908.010416666664 | 7.89 |
| 44908.020833333336 | 7.89 |
| 44908.03125 | 7.89 |
| 44908.041666666664 | 7.89 |
| 44908.052083333336 | 7.89 |
| 44908.0625 | 7.9 |
| 44908.072916666664 | 7.9 |
| 44908.083333333336 | 7.91 |
| 44908.09375 | 7.91 |
| 44908.104166666664 | 7.9 |
| 44908.114583333336 | 7.9 |
| 44908.125 | 7.9 |
| 44908.135416666664 | 7.9 |
| 44908.145833333336 | 7.9 |
| 44908.15625 | 7.9 |
| 44908.166666666664 | 7.9 |
| 44908.177083333336 | 7.9 |
| 44908.1875 | 7.9 |
| 44908.197916666664 | 7.89 |
| 44908.208333333336 | 7.89 |
| 44908.21875 | 7.89 |
| 44908.229166666664 | 7.89 |
| 44908.239583333336 | 7.89 |
| 44908.25 | 7.89 |
| 44908.260416666664 | 7.89 |
| 44908.270833333336 | 7.88 |
| 44908.28125 | 7.88 |
| 44908.291666666664 | 7.87 |
| 44908.302083333336 | 7.87 |
| 44908.3125 | 7.86 |
| 44908.322916666664 | 7.85 |
| 44908.333333333336 | 7.85 |
| 44908.34375 | 7.84 |
| 44908.354166666664 | 7.84 |
| 44908.364583333336 | 7.84 |
| 44908.375 | 7.84 |
| 44908.385416666664 | 7.84 |
| 44908.395833333336 | 7.86 |
| 44908.40625 | 7.85 |
| 44908.416666666664 | 7.86 |
| 44908.427083333336 | 7.86 |
| 44908.4375 | 7.86 |
| 44908.447916666664 | 7.86 |
| 44908.458333333336 | 7.86 |
| 44908.46875 | 7.85 |
| 44908.479166666664 | 7.85 |
| 44908.489583333336 | 7.85 |
| 44908.5 | 7.85 |
| 44908.510416666664 | 7.86 |
| 44908.520833333336 | 7.86 |
| 44908.53125 | 7.87 |
| 44908.541666666664 | 7.87 |
| 44908.552083333336 | 7.88 |
| 44908.5625 | 7.88 |
| 44908.572916666664 | 7.89 |
| 44908.583333333336 | 7.89 |
| 44908.59375 | 7.9 |
| 44908.604166666664 | 7.9 |
| 44908.614583333336 | 7.9 |
| 44908.625 | 7.91 |
| 44908.635416666664 | 7.91 |
| 44908.645833333336 | 7.92 |
| 44908.65625 | 7.92 |
| 44908.666666666664 | 7.92 |
| 44908.677083333336 | 7.92 |
| 44908.6875 | 7.92 |
| 44908.697916666664 | 7.93 |
| 44908.708333333336 | 7.93 |
| 44908.71875 | 7.92 |
| 44908.729166666664 | 7.92 |
| 44908.739583333336 | 7.91 |
| 44908.75 | 7.92 |
| 44908.760416666664 | 7.92 |
| 44908.770833333336 | 7.93 |
| 44908.78125 | 7.93 |
| 44908.791666666664 | 7.92 |
| 44908.802083333336 | 7.92 |
| 44908.8125 | 7.92 |
| 44908.822916666664 | 7.92 |
| 44908.833333333336 | 7.92 |
| 44908.84375 | 7.92 |
| 44908.854166666664 | 7.92 |
| 44908.864583333336 | 7.91 |
| 44908.875 | 7.92 |
| 44908.885416666664 | 7.91 |
| 44908.895833333336 | 7.91 |
| 44908.90625 | 7.91 |
| 44908.916666666664 | 7.91 |
| 44908.927083333336 | 7.91 |
| 44908.9375 | 7.9 |
| 44908.947916666664 | 7.9 |
| 44908.958333333336 | 7.9 |
| 44908.96875 | 7.9 |
| 44908.979166666664 | 7.9 |
| 44908.989583333336 | 7.9 |
| 44909.0 | 7.9 |
| 44909.010416666664 | 7.89 |
| 44909.020833333336 | 7.89 |
| 44909.03125 | 7.89 |
| 44909.041666666664 | 7.89 |
| 44909.052083333336 | 7.9 |
| 44909.0625 | 7.9 |
| 44909.072916666664 | 7.9 |
| 44909.083333333336 | 7.9 |
| 44909.09375 | 7.91 |
| 44909.104166666664 | 7.91 |
| 44909.114583333336 | 7.91 |
| 44909.125 | 7.91 |
| 44909.135416666664 | 7.91 |
| 44909.145833333336 | 7.91 |
| 44909.15625 | 7.91 |
| 44909.166666666664 | 7.91 |
| 44909.177083333336 | 7.91 |
| 44909.1875 | 7.91 |
| 44909.197916666664 | 7.91 |
| 44909.208333333336 | 7.91 |
| 44909.21875 | 7.91 |
| 44909.229166666664 | 7.9 |
| 44909.239583333336 | 7.9 |
| 44909.25 | 7.9 |
| 44909.260416666664 | 7.9 |
| 44909.270833333336 | 7.9 |
| 44909.28125 | 7.9 |
| 44909.291666666664 | 7.89 |
| 44909.302083333336 | 7.89 |
| 44909.3125 | 7.89 |
| 44909.322916666664 | 7.88 |
| 44909.333333333336 | 7.88 |
| 44909.34375 | 7.88 |
| 44909.354166666664 | 7.87 |
| 44909.364583333336 | 7.87 |
| 44909.375 | 7.87 |
| 44909.385416666664 | 7.88 |
| 44909.395833333336 | 7.88 |
| 44909.40625 | 7.88 |
| 44909.416666666664 | 7.88 |
| 44909.427083333336 | 7.87 |
| 44909.4375 | 7.87 |
| 44909.447916666664 | 7.87 |
| 44909.458333333336 | 7.87 |
| 44909.46875 | 7.87 |
| 44909.479166666664 | 7.87 |
| 44909.489583333336 | 7.87 |
| 44909.5 | 7.87 |
| 44909.510416666664 | 7.87 |
| 44909.520833333336 | 7.87 |
| 44909.53125 | 7.87 |
| 44909.541666666664 | 7.88 |
| 44909.552083333336 | 7.89 |
| 44909.5625 | 7.89 |
| 44909.572916666664 | 7.9 |
| 44909.583333333336 | 7.9 |
| 44909.59375 | 7.91 |
| 44909.604166666664 | 7.92 |
| 44909.614583333336 | 7.92 |
| 44909.625 | 7.92 |
| 44909.635416666664 | 7.93 |
| 44909.645833333336 | 7.93 |
| 44909.65625 | 7.93 |
| 44909.666666666664 | 7.93 |
| 44909.677083333336 | 7.94 |
| 44909.6875 | 7.94 |
| 44909.697916666664 | 7.94 |
| 44909.708333333336 | 7.95 |
| 44909.71875 | 7.94 |
| 44909.729166666664 | 7.95 |
| 44909.739583333336 | 7.93 |
| 44909.75 | 7.93 |
| 44909.760416666664 | 7.94 |
| 44909.770833333336 | 7.94 |
| 44909.78125 | 7.94 |
| 44909.791666666664 | 7.93 |
| 44909.802083333336 | 7.94 |
| 44909.8125 | 7.94 |
| 44909.822916666664 | 7.94 |
| 44909.833333333336 | 7.94 |
| 44909.84375 | 7.94 |
| 44909.854166666664 | 7.93 |
| 44909.864583333336 | 7.93 |
| 44909.875 | 7.93 |
| 44909.885416666664 | 7.93 |
| 44909.895833333336 | 7.93 |
| 44909.90625 | 7.93 |
| 44909.916666666664 | 7.93 |
| 44909.927083333336 | 7.93 |
| 44909.9375 | 7.93 |
| 44909.947916666664 | 7.92 |
| 44909.958333333336 | 7.92 |
| 44909.96875 | 7.92 |
| 44909.979166666664 | 7.91 |
| 44909.989583333336 | 7.91 |
| 44910.0 | 7.91 |
| 44910.010416666664 | 7.91 |
| 44910.020833333336 | 7.91 |
| 44910.03125 | 7.9 |
| 44910.041666666664 | 7.91 |
| 44910.052083333336 | 7.91 |
| 44910.0625 | 7.91 |
| 44910.072916666664 | 7.91 |
| 44910.083333333336 | 7.91 |
| 44910.09375 | 7.91 |
| 44910.104166666664 | 7.92 |
| 44910.114583333336 | 7.92 |
| 44910.125 | 7.93 |
| 44910.135416666664 | 7.93 |
| 44910.145833333336 | 7.92 |
| 44910.15625 | 7.92 |
| 44910.166666666664 | 7.92 |
| 44910.177083333336 | 7.92 |
| 44910.1875 | 7.92 |
| 44910.197916666664 | 7.92 |
| 44910.208333333336 | 7.92 |
| 44910.21875 | 7.92 |
| 44910.229166666664 | 7.92 |
| 44910.239583333336 | 7.92 |
| 44910.25 | 7.91 |
| 44910.260416666664 | 7.91 |
| 44910.270833333336 | 7.91 |
| 44910.28125 | 7.91 |
| 44910.291666666664 | 7.91 |
| 44910.302083333336 | 7.91 |
| 44910.3125 | 7.9 |
| 44910.322916666664 | 7.9 |
| 44910.333333333336 | 7.9 |
| 44910.34375 | 7.89 |
| 44910.354166666664 | 7.89 |
| 44910.364583333336 | 7.89 |
| 44910.375 | 7.88 |
| 44910.385416666664 | 7.88 |
| 44910.395833333336 | 7.88 |
| 44910.40625 | 7.87 |
| 44910.416666666664 | 7.87 |
| 44910.427083333336 | 7.87 |
| 44910.4375 | 7.88 |
| 44910.447916666664 | 7.88 |
| 44910.458333333336 | 7.88 |
| 44910.46875 | 7.87 |
| 44910.479166666664 | 7.88 |
| 44910.489583333336 | 7.87 |
| 44910.5 | 7.87 |
| 44910.510416666664 | 7.87 |
| 44910.520833333336 | 7.87 |
| 44910.53125 | 7.87 |
| 44910.541666666664 | 7.87 |
| 44910.552083333336 | 7.87 |
| 44910.5625 | 7.87 |
| 44910.572916666664 | 7.88 |
| 44910.583333333336 | 7.88 |
| 44910.59375 | 7.89 |
| 44910.604166666664 | 7.9 |
| 44910.614583333336 | 7.9 |
| 44910.625 | 7.9 |
| 44910.635416666664 | 7.9 |
| 44910.645833333336 | 7.9 |
| 44910.65625 | 7.9 |
| 44910.666666666664 | 7.91 |
| 44910.677083333336 | 7.91 |
| 44910.6875 | 7.91 |
| 44910.697916666664 | 7.91 |
| 44910.708333333336 | 7.92 |
| 44910.71875 | 7.93 |
| 44910.729166666664 | 7.93 |
| 44910.739583333336 | 7.93 |
| 44910.75 | 7.93 |
| 44910.760416666664 | 7.92 |
| 44910.770833333336 | 7.92 |
| 44910.78125 | 7.91 |
| 44910.791666666664 | 7.92 |
| 44910.802083333336 | 7.91 |
| 44910.8125 | 7.9 |
| 44910.822916666664 | 7.9 |
| 44910.833333333336 | 7.9 |
| 44910.84375 | 7.89 |
| 44910.854166666664 | 7.89 |
| 44910.864583333336 | 7.89 |
| 44910.875 | 7.89 |
| 44910.885416666664 | 7.88 |
| 44910.895833333336 | 7.88 |
| 44910.90625 | 7.88 |
| 44910.916666666664 | 7.88 |
| 44910.927083333336 | 7.87 |
| 44910.9375 | 7.87 |
| 44910.947916666664 | 7.87 |
| 44910.958333333336 | 7.87 |
| 44910.96875 | 7.87 |
| 44910.979166666664 | 7.87 |
| 44910.989583333336 | 7.87 |
| 44911.0 | 7.87 |
| 44911.010416666664 | 7.87 |
| 44911.020833333336 | 7.88 |
| 44911.03125 | 7.87 |
| 44911.041666666664 | 7.87 |
| 44911.052083333336 | 7.88 |
| 44911.0625 | 7.88 |
| 44911.072916666664 | 7.88 |
| 44911.083333333336 | 7.88 |
| 44911.09375 | 7.88 |
| 44911.104166666664 | 7.88 |
| 44911.114583333336 | 7.88 |
| 44911.125 | 7.87 |
| 44911.135416666664 | 7.86 |
| 44911.145833333336 | 7.87 |
| 44911.15625 | 7.87 |
| 44911.166666666664 | 7.87 |
| 44911.177083333336 | 7.87 |
| 44911.1875 | 7.87 |
| 44911.197916666664 | 7.87 |
| 44911.208333333336 | 7.87 |
| 44911.21875 | 7.87 |
| 44911.229166666664 | 7.88 |
| 44911.239583333336 | 7.88 |
| 44911.25 | 7.89 |
| 44911.260416666664 | 7.89 |
| 44911.270833333336 | 7.89 |
| 44911.28125 | 7.89 |
| 44911.291666666664 | 7.89 |
| 44911.302083333336 | 7.88 |
| 44911.3125 | 7.89 |
| 44911.322916666664 | 7.89 |
| 44911.333333333336 | 7.88 |
| 44911.34375 | 7.88 |
| 44911.354166666664 | 7.87 |
| 44911.364583333336 | 7.86 |
| 44911.375 | 7.86 |
| 44911.385416666664 | 7.85 |
| 44911.395833333336 | 7.85 |
| 44911.40625 | 7.84 |
| 44911.416666666664 | 7.84 |
| 44911.427083333336 | 7.83 |
| 44911.4375 | 7.83 |
| 44911.447916666664 | 7.83 |
| 44911.458333333336 | 7.83 |
| 44911.46875 | 7.83 |
| 44911.479166666664 | 7.82 |
| 44911.489583333336 | 7.82 |
| 44911.5 | 7.82 |
| 44911.510416666664 | 7.82 |
| 44911.520833333336 | 7.82 |
| 44911.53125 | 7.82 |
| 44911.541666666664 | 7.82 |
| 44911.552083333336 | 7.83 |
| 44911.5625 | 7.83 |
| 44911.572916666664 | 7.83 |
| 44911.583333333336 | 7.84 |
| 44911.59375 | 7.84 |
| 44911.604166666664 | 7.85 |
| 44911.614583333336 | 7.85 |
| 44911.625 | 7.86 |
| 44911.635416666664 | 7.86 |
| 44911.645833333336 | 7.87 |
| 44911.65625 | 7.88 |
| 44911.666666666664 | 7.89 |
| 44911.677083333336 | 7.89 |
| 44911.6875 | 7.89 |
| 44911.697916666664 | 7.89 |
| 44911.708333333336 | 7.9 |
| 44911.71875 | 7.89 |
| 44911.729166666664 | 7.89 |
| 44911.739583333336 | 7.89 |
| 44911.75 | 7.89 |
| 44911.760416666664 | 7.9 |
| 44911.770833333336 | 7.9 |
| 44911.78125 | 7.9 |
| 44911.791666666664 | 7.9 |
| 44911.802083333336 | 7.91 |
| 44911.8125 | 7.91 |
| 44911.822916666664 | 7.91 |
| 44911.833333333336 | 7.91 |
| 44911.84375 | 7.91 |
| 44911.854166666664 | 7.91 |
| 44911.864583333336 | 7.9 |
| 44911.875 | 7.9 |
| 44911.885416666664 | 7.9 |
| 44911.895833333336 | 7.9 |
| 44911.90625 | 7.9 |
| 44911.916666666664 | 7.9 |
| 44911.927083333336 | 7.89 |
| 44911.9375 | 7.89 |
| 44911.947916666664 | 7.89 |
| 44911.958333333336 | 7.89 |
| 44911.96875 | 7.89 |
| 44911.979166666664 | 7.88 |
| 44911.989583333336 | 7.88 |
| 44912.0 | 7.87 |
| 44912.010416666664 | 7.88 |
| 44912.020833333336 | 7.87 |
| 44912.03125 | 7.87 |
| 44912.041666666664 | 7.86 |
| 44912.052083333336 | 7.85 |
| 44912.0625 | 7.85 |
| 44912.072916666664 | 7.85 |
| 44912.083333333336 | 7.84 |
| 44912.09375 | 7.84 |
| 44912.104166666664 | 7.84 |
| 44912.114583333336 | 7.84 |
| 44912.125 | 7.85 |
| 44912.135416666664 | 7.85 |
| 44912.145833333336 | 7.86 |
| 44912.15625 | 7.86 |
| 44912.166666666664 | 7.87 |
| 44912.177083333336 | 7.88 |
| 44912.1875 | 7.88 |
| 44912.197916666664 | 7.88 |
| 44912.208333333336 | 7.88 |
| 44912.21875 | 7.88 |
| 44912.229166666664 | 7.88 |
| 44912.239583333336 | 7.88 |
| 44912.25 | 7.88 |
| 44912.260416666664 | 7.88 |
| 44912.270833333336 | 7.88 |
| 44912.28125 | 7.88 |
| 44912.291666666664 | 7.88 |
| 44912.302083333336 | 7.88 |
| 44912.3125 | 7.88 |
| 44912.322916666664 | 7.87 |
| 44912.333333333336 | 7.87 |
| 44912.34375 | 7.87 |
| 44912.354166666664 | 7.87 |
| 44912.364583333336 | 7.87 |
| 44912.375 | 7.87 |
| 44912.385416666664 | 7.87 |
| 44912.395833333336 | 7.87 |
| 44912.40625 | 7.86 |
| 44912.416666666664 | 7.86 |
| 44912.427083333336 | 7.86 |
| 44912.4375 | 7.86 |
| 44912.447916666664 | 7.86 |
| 44912.458333333336 | 7.85 |
| 44912.46875 | 7.83 |
| 44912.479166666664 | 7.82 |
| 44912.489583333336 | 7.82 |
| 44912.5 | 7.8 |
| 44912.510416666664 | 7.8 |
| 44912.520833333336 | 7.83 |
| 44912.53125 | 7.81 |
| 44912.541666666664 | 7.83 |
| 44912.552083333336 | 7.83 |
| 44912.5625 | 7.82 |
| 44912.572916666664 | 7.82 |
| 44912.583333333336 | 7.82 |
| 44912.59375 | 7.82 |
| 44912.604166666664 | 7.83 |
| 44912.614583333336 | 7.83 |
| 44912.625 | 7.84 |
| 44912.635416666664 | 7.84 |
| 44912.645833333336 | 7.85 |
| 44912.65625 | 7.85 |
| 44912.666666666664 | 7.85 |
| 44912.677083333336 | 7.86 |
| 44912.6875 | 7.87 |
| 44912.697916666664 | 7.88 |
| 44912.708333333336 | 7.9 |
| 44912.71875 | 7.9 |
| 44912.729166666664 | 7.91 |
| 44912.739583333336 | 7.91 |
| 44912.75 | 7.91 |
| 44912.760416666664 | 7.91 |
| 44912.770833333336 | 7.91 |
| 44912.78125 | 7.91 |
| 44912.791666666664 | 7.91 |
| 44912.802083333336 | 7.91 |
| 44912.8125 | 7.91 |
| 44912.822916666664 | 7.91 |
| 44912.833333333336 | 7.91 |
| 44912.84375 | 7.91 |
| 44912.854166666664 | 7.9 |
| 44912.864583333336 | 7.89 |
| 44912.875 | 7.9 |
| 44912.885416666664 | 7.9 |
| 44912.895833333336 | 7.91 |
| 44912.90625 | 7.91 |
| 44912.916666666664 | 7.91 |
| 44912.927083333336 | 7.91 |
| 44912.9375 | 7.9 |
| 44912.947916666664 | 7.9 |
| 44912.958333333336 | 7.9 |
| 44912.96875 | 7.9 |
| 44912.979166666664 | 7.9 |
| 44912.989583333336 | 7.89 |
| 44913.0 | 7.89 |
| 44913.010416666664 | 7.89 |
| 44913.020833333336 | 7.88 |
| 44913.03125 | 7.88 |
| 44913.041666666664 | 7.86 |
| 44913.052083333336 | 7.85 |
| 44913.0625 | 7.84 |
| 44913.072916666664 | 7.84 |
| 44913.083333333336 | 7.83 |
| 44913.09375 | 7.83 |
| 44913.104166666664 | 7.83 |
| 44913.114583333336 | 7.82 |
| 44913.125 | 7.83 |
| 44913.135416666664 | 7.83 |
| 44913.145833333336 | 7.84 |
| 44913.15625 | 7.84 |
| 44913.166666666664 | 7.85 |
| 44913.177083333336 | 7.86 |
| 44913.1875 | 7.86 |
| 44913.197916666664 | 7.87 |
| 44913.208333333336 | 7.88 |
| 44913.21875 | 7.88 |
| 44913.229166666664 | 7.88 |
| 44913.239583333336 | 7.88 |
| 44913.25 | 7.88 |
| 44913.260416666664 | 7.88 |
| 44913.270833333336 | 7.87 |
| 44913.28125 | 7.87 |
| 44913.291666666664 | 7.87 |
| 44913.302083333336 | 7.87 |
| 44913.3125 | 7.87 |
| 44913.322916666664 | 7.87 |
| 44913.333333333336 | 7.87 |
| 44913.34375 | 7.87 |
| 44913.354166666664 | 7.87 |
| 44913.364583333336 | 7.87 |
| 44913.375 | 7.87 |
| 44913.385416666664 | 7.87 |
| 44913.395833333336 | 7.87 |
| 44913.40625 | 7.87 |
| 44913.416666666664 | 7.87 |
| 44913.427083333336 | 7.87 |
| 44913.4375 | 7.87 |
| 44913.447916666664 | 7.87 |
| 44913.458333333336 | 7.86 |
| 44913.46875 | 7.86 |
| 44913.479166666664 | 7.85 |
| 44913.489583333336 | 7.85 |
| 44913.5 | 7.84 |
| 44913.510416666664 | 7.84 |
| 44913.520833333336 | 7.84 |
| 44913.53125 | 7.84 |
| 44913.541666666664 | 7.84 |
| 44913.552083333336 | 7.84 |
| 44913.5625 | 7.83 |
| 44913.572916666664 | 7.83 |
| 44913.583333333336 | 7.82 |
| 44913.59375 | 7.82 |
| 44913.604166666664 | 7.82 |
| 44913.614583333336 | 7.83 |
| 44913.625 | 7.83 |
| 44913.635416666664 | 7.84 |
| 44913.645833333336 | 7.84 |
| 44913.65625 | 7.84 |
| 44913.666666666664 | 7.85 |
| 44913.677083333336 | 7.85 |
| 44913.6875 | 7.86 |
| 44913.697916666664 | 7.86 |
| 44913.708333333336 | 7.87 |
| 44913.71875 | 7.88 |
| 44913.729166666664 | 7.9 |
| 44913.739583333336 | 7.91 |
| 44913.75 | 7.91 |
| 44913.760416666664 | 7.91 |
| 44913.770833333336 | 7.91 |
| 44913.78125 | 7.92 |
| 44913.791666666664 | 7.9 |
| 44913.802083333336 | 7.91 |
| 44913.8125 | 7.91 |
| 44913.822916666664 | 7.91 |
| 44913.833333333336 | 7.9 |
| 44913.84375 | 7.91 |
| 44913.854166666664 | 7.91 |
| 44913.864583333336 | 7.91 |
| 44913.875 | 7.91 |
| 44913.885416666664 | 7.9 |
| 44913.895833333336 | 7.9 |
| 44913.90625 | 7.9 |
| 44913.916666666664 | 7.91 |
| 44913.927083333336 | 7.9 |
| 44913.9375 | 7.9 |
| 44913.947916666664 | 7.91 |
| 44913.958333333336 | 7.91 |
| 44913.96875 | 7.91 |
| 44913.979166666664 | 7.91 |
| 44913.989583333336 | 7.9 |
| 44914.0 | 7.9 |
| 44914.010416666664 | 7.9 |
| 44914.020833333336 | 7.89 |
| 44914.03125 | 7.89 |
| 44914.041666666664 | 7.9 |
| 44914.052083333336 | 7.9 |
| 44914.0625 | 7.9 |
| 44914.072916666664 | 7.9 |
| 44914.083333333336 | 7.9 |
| 44914.09375 | 7.89 |
| 44914.104166666664 | 7.89 |
| 44914.114583333336 | 7.89 |
| 44914.125 | 7.88 |
| 44914.135416666664 | 7.88 |
| 44914.145833333336 | 7.88 |
| 44914.15625 | 7.88 |
| 44914.166666666664 | 7.88 |
| 44914.177083333336 | 7.88 |
| 44914.1875 | 7.88 |
| 44914.197916666664 | 7.88 |
| 44914.208333333336 | 7.89 |
| 44914.21875 | 7.89 |
| 44914.229166666664 | 7.89 |
| 44914.239583333336 | 7.89 |
| 44914.25 | 7.89 |
| 44914.260416666664 | 7.89 |
| 44914.270833333336 | 7.89 |
| 44914.28125 | 7.89 |
| 44914.291666666664 | 7.89 |
| 44914.302083333336 | 7.89 |
| 44914.3125 | 7.89 |
| 44914.322916666664 | 7.89 |
| 44914.333333333336 | 7.89 |
| 44914.34375 | 7.89 |
| 44914.354166666664 | 7.89 |
| 44914.364583333336 | 7.88 |
| 44914.375 | 7.89 |
| 44914.385416666664 | 7.89 |
| 44914.395833333336 | 7.89 |
| 44914.40625 | 7.89 |
| 44914.416666666664 | 7.89 |
| 44914.427083333336 | 7.88 |
| 44914.4375 | 7.88 |
| 44914.447916666664 | 7.89 |
| 44914.458333333336 | 7.89 |
| 44914.46875 | 7.89 |
| 44914.479166666664 | 7.89 |
| 44914.489583333336 | 7.88 |
| 44914.5 | 7.87 |
| 44914.510416666664 | 7.87 |
| 44914.520833333336 | 7.86 |
| 44914.53125 | 7.86 |
| 44914.541666666664 | 7.85 |
| 44914.552083333336 | 7.86 |
| 44914.5625 | 7.85 |
| 44914.572916666664 | 7.85 |
| 44914.583333333336 | 7.88 |
| 44914.59375 | 7.88 |
| 44914.604166666664 | 7.88 |
| 44914.614583333336 | 7.88 |
| 44914.625 | 7.88 |
| 44914.635416666664 | 7.88 |
| 44914.645833333336 | 7.88 |
| 44914.65625 | 7.89 |
| 44914.666666666664 | 7.89 |
| 44914.677083333336 | 7.75 |
| 44914.6875 | 7.76 |
| 44914.697916666664 | 7.76 |
| 44914.708333333336 | 7.76 |
| 44914.71875 | 7.77 |
| 44914.729166666664 | 7.77 |
| 44914.739583333336 | 7.78 |
| 44914.75 | 7.8 |
| 44914.760416666664 | 7.81 |
| 44914.770833333336 | 7.82 |
| 44914.78125 | 7.83 |
| 44914.791666666664 | 7.83 |
| 44914.802083333336 | 7.83 |
| 44914.8125 | 7.84 |
| 44914.822916666664 | 7.84 |
| 44914.833333333336 | 7.84 |
| 44914.84375 | 7.84 |
| 44914.854166666664 | 7.85 |
| 44914.864583333336 | 7.85 |
| 44914.875 | 7.85 |
| 44914.885416666664 | 7.86 |
| 44914.895833333336 | 7.86 |
| 44914.90625 | 7.86 |
| 44914.916666666664 | 7.87 |
| 44914.927083333336 | 7.87 |
| 44914.9375 | 7.88 |
| 44914.947916666664 | 7.87 |
| 44914.958333333336 | 7.87 |
| 44914.96875 | 7.87 |
| 44914.979166666664 | 7.87 |
| 44914.989583333336 | 7.87 |
| 44915.0 | 7.86 |
| 44915.010416666664 | 7.86 |
| 44915.020833333336 | 7.86 |
| 44915.03125 | 7.85 |
| 44915.041666666664 | 7.85 |
| 44915.052083333336 | 7.85 |
| 44915.0625 | 7.85 |
| 44915.072916666664 | 7.85 |
| 44915.083333333336 | 7.85 |
| 44915.09375 | 7.85 |
| 44915.104166666664 | 7.85 |
| 44915.114583333336 | 7.85 |
| 44915.125 | 7.85 |
| 44915.135416666664 | 7.85 |
| 44915.145833333336 | 7.84 |
| 44915.15625 | 7.84 |
| 44915.166666666664 | 7.84 |
| 44915.177083333336 | 7.84 |
| 44915.1875 | 7.84 |
| 44915.197916666664 | 7.84 |
| 44915.208333333336 | 7.84 |
| 44915.21875 | 7.84 |
| 44915.229166666664 | 7.84 |
| 44915.239583333336 | 7.84 |
| 44915.25 | 7.85 |
| 44915.260416666664 | 7.85 |
| 44915.270833333336 | 7.85 |
| 44915.28125 | 7.85 |
| 44915.291666666664 | 7.85 |
| 44915.302083333336 | 7.85 |
| 44915.3125 | 7.85 |
| 44915.322916666664 | 7.85 |
| 44915.333333333336 | 7.86 |
| 44915.34375 | 7.86 |
| 44915.354166666664 | 7.86 |
| 44915.364583333336 | 7.86 |
| 44915.375 | 7.86 |
| 44915.385416666664 | 7.86 |
| 44915.395833333336 | 7.86 |
| 44915.40625 | 7.87 |
| 44915.416666666664 | 7.87 |
| 44915.427083333336 | 7.87 |
| 44915.4375 | 7.87 |
| 44915.447916666664 | 7.86 |
| 44915.458333333336 | 7.86 |
| 44915.46875 | 7.86 |
| 44915.479166666664 | 7.86 |
| 44915.489583333336 | 7.86 |
| 44915.5 | 7.86 |
| 44915.510416666664 | 7.86 |
| 44915.520833333336 | 7.85 |
| 44915.53125 | 7.85 |
| 44915.541666666664 | 7.85 |
| 44915.552083333336 | 7.85 |
| 44915.5625 | 7.84 |
| 44915.572916666664 | 7.83 |
| 44915.583333333336 | 7.82 |
| 44915.59375 | 7.82 |
| 44915.604166666664 | 7.82 |
| 44915.614583333336 | 7.82 |
| 44915.625 | 7.83 |
| 44915.635416666664 | 7.83 |
| 44915.645833333336 | 7.83 |
| 44915.65625 | 7.83 |
| 44915.666666666664 | 7.83 |
| 44915.677083333336 | 7.83 |
| 44915.6875 | 7.83 |
| 44915.697916666664 | 7.83 |
| 44915.708333333336 | 7.83 |
| 44915.71875 | 7.83 |
| 44915.729166666664 | 7.83 |
| 44915.739583333336 | 7.83 |
| 44915.75 | 7.83 |
| 44915.760416666664 | 7.83 |
| 44915.770833333336 | 7.84 |
| 44915.78125 | 7.84 |
| 44915.791666666664 | 7.84 |
| 44915.802083333336 | 7.85 |
| 44915.8125 | 7.86 |
| 44915.822916666664 | 7.86 |
| 44915.833333333336 | 7.86 |
| 44915.84375 | 7.87 |
| 44915.854166666664 | 7.87 |
| 44915.864583333336 | 7.87 |
| 44915.875 | 7.88 |
| 44915.885416666664 | 7.88 |
| 44915.895833333336 | 7.88 |
| 44915.90625 | 7.89 |
| 44915.916666666664 | 7.89 |
| 44915.927083333336 | 7.89 |
| 44915.9375 | 7.89 |
| 44915.947916666664 | 7.9 |
| 44915.958333333336 | 7.9 |
| 44915.96875 | 7.89 |
| 44915.979166666664 | 7.89 |
| 44915.989583333336 | 7.89 |
| 44916.0 | 7.89 |
| 44916.010416666664 | 7.89 |
| 44916.020833333336 | 7.88 |
| 44916.03125 | 7.88 |
| 44916.041666666664 | 7.87 |
| 44916.052083333336 | 7.87 |
| 44916.0625 | 7.86 |
| 44916.072916666664 | 7.85 |
| 44916.083333333336 | 7.86 |
| 44916.09375 | 7.87 |
| 44916.104166666664 | 7.87 |
| 44916.114583333336 | 7.87 |
| 44916.125 | 7.87 |
| 44916.135416666664 | 7.86 |
| 44916.145833333336 | 7.86 |
| 44916.15625 | 7.86 |
| 44916.166666666664 | 7.86 |
| 44916.177083333336 | 7.86 |
| 44916.1875 | 7.86 |
| 44916.197916666664 | 7.86 |
| 44916.208333333336 | 7.86 |
| 44916.21875 | 7.86 |
| 44916.229166666664 | 7.86 |
| 44916.239583333336 | 7.86 |
| 44916.25 | 7.85 |
| 44916.260416666664 | 7.85 |
| 44916.270833333336 | 7.86 |
| 44916.28125 | 7.86 |
| 44916.291666666664 | 7.86 |
| 44916.302083333336 | 7.86 |
| 44916.3125 | 7.87 |
| 44916.322916666664 | 7.87 |
| 44916.333333333336 | 7.87 |
| 44916.34375 | 7.87 |
| 44916.354166666664 | 7.87 |
| 44916.364583333336 | 7.87 |
| 44916.375 | 7.87 |
| 44916.385416666664 | 7.87 |
| 44916.395833333336 | 7.88 |
| 44916.40625 | 7.88 |
| 44916.416666666664 | 7.88 |
| 44916.427083333336 | 7.88 |
| 44916.4375 | 7.88 |
| 44916.447916666664 | 7.88 |
| 44916.458333333336 | 7.87 |
| 44916.46875 | 7.87 |
| 44916.479166666664 | 7.87 |
| 44916.489583333336 | 7.87 |
| 44916.5 | 7.87 |
| 44916.510416666664 | 7.87 |
| 44916.520833333336 | 7.87 |
| 44916.53125 | 7.87 |
| 44916.541666666664 | 7.87 |
| 44916.552083333336 | 7.87 |
| 44916.5625 | 7.86 |
| 44916.572916666664 | 7.86 |
| 44916.583333333336 | 7.86 |
| 44916.59375 | 7.86 |
| 44916.604166666664 | 7.85 |
| 44916.614583333336 | 7.85 |
| 44916.625 | 7.84 |
| 44916.635416666664 | 7.84 |
| 44916.645833333336 | 7.84 |
| 44916.65625 | 7.83 |
| 44916.666666666664 | 7.84 |
| 44916.677083333336 | 7.85 |
| 44916.6875 | 7.85 |
| 44916.697916666664 | 7.85 |
| 44916.708333333336 | 7.85 |
| 44916.71875 | 7.85 |
| 44916.729166666664 | 7.85 |
| 44916.739583333336 | 7.85 |
| 44916.75 | 7.85 |
| 44916.760416666664 | 7.85 |
| 44916.770833333336 | 7.85 |
| 44916.78125 | 7.85 |
| 44916.791666666664 | 7.85 |
| 44916.802083333336 | 7.86 |
| 44916.8125 | 7.86 |
| 44916.822916666664 | 7.86 |
| 44916.833333333336 | 7.87 |
| 44916.84375 | 7.87 |
| 44916.854166666664 | 7.88 |
| 44916.864583333336 | 7.88 |
| 44916.875 | 7.88 |
| 44916.885416666664 | 7.89 |
| 44916.895833333336 | 7.89 |
| 44916.90625 | 7.89 |
| 44916.916666666664 | 7.9 |
| 44916.927083333336 | 7.9 |
| 44916.9375 | 7.9 |
| 44916.947916666664 | 7.9 |
| 44916.958333333336 | 7.9 |
| 44916.96875 | 7.91 |
| 44916.979166666664 | 7.91 |
| 44916.989583333336 | 7.91 |
| 44917.0 | 7.91 |
| 44917.010416666664 | 7.9 |
| 44917.020833333336 | 7.91 |
| 44917.03125 | 7.9 |
| 44917.041666666664 | 7.9 |
| 44917.052083333336 | 7.9 |
| 44917.0625 | 7.9 |
| 44917.072916666664 | 7.9 |
| 44917.083333333336 | 7.89 |
| 44917.09375 | 7.88 |
| 44917.104166666664 | 7.88 |
| 44917.114583333336 | 7.87 |
| 44917.125 | 7.85 |
| 44917.135416666664 | 7.85 |
| 44917.145833333336 | 7.85 |
| 44917.15625 | 7.87 |
| 44917.166666666664 | 7.88 |
| 44917.177083333336 | 7.87 |
| 44917.1875 | 7.87 |
| 44917.197916666664 | 7.87 |
| 44917.208333333336 | 7.87 |
| 44917.21875 | 7.87 |
| 44917.229166666664 | 7.87 |
| 44917.239583333336 | 7.87 |
| 44917.25 | 7.87 |
| 44917.260416666664 | 7.87 |
| 44917.270833333336 | 7.87 |
| 44917.28125 | 7.86 |
| 44917.291666666664 | 7.87 |
| 44917.302083333336 | 7.87 |
| 44917.3125 | 7.87 |
| 44917.322916666664 | 7.87 |
| 44917.333333333336 | 7.87 |
| 44917.34375 | 7.87 |
| 44917.354166666664 | 7.87 |
| 44917.364583333336 | 7.87 |
| 44917.375 | 7.88 |
| 44917.385416666664 | 7.88 |
| 44917.395833333336 | 7.88 |
| 44917.40625 | 7.88 |
| 44917.416666666664 | 7.88 |
| 44917.427083333336 | 7.88 |
| 44917.4375 | 7.88 |
| 44917.447916666664 | 7.88 |
| 44917.458333333336 | 7.89 |
| 44917.46875 | 7.88 |
| 44917.479166666664 | 7.88 |
| 44917.489583333336 | 7.88 |
| 44917.5 | 7.88 |
| 44917.510416666664 | 7.88 |
| 44917.520833333336 | 7.88 |
| 44917.53125 | 7.88 |
| 44917.541666666664 | 7.87 |
| 44917.552083333336 | 7.87 |
| 44917.5625 | 7.87 |
| 44917.572916666664 | 7.87 |
| 44917.583333333336 | 7.87 |
| 44917.59375 | 7.87 |
| 44917.604166666664 | 7.87 |
| 44917.614583333336 | 7.87 |
| 44917.625 | 7.87 |
| 44917.635416666664 | 7.87 |
| 44917.645833333336 | 7.87 |
| 44917.65625 | 7.87 |
| 44917.666666666664 | 7.86 |
| 44917.677083333336 | 7.86 |
| 44917.6875 | 7.85 |
| 44917.697916666664 | 7.85 |
| 44917.708333333336 | 7.85 |
| 44917.71875 | 7.85 |
| 44917.729166666664 | 7.85 |
| 44917.739583333336 | 7.86 |
| 44917.75 | 7.86 |
| 44917.760416666664 | 7.86 |
| 44917.770833333336 | 7.86 |
| 44917.78125 | 7.85 |
| 44917.791666666664 | 7.85 |
| 44917.802083333336 | 7.85 |
| 44917.8125 | 7.85 |
| 44917.822916666664 | 7.85 |
| 44917.833333333336 | 7.85 |
| 44917.84375 | 7.85 |
| 44917.854166666664 | 7.85 |
| 44917.864583333336 | 7.86 |
| 44917.875 | 7.86 |
| 44917.885416666664 | 7.87 |
| 44917.895833333336 | 7.87 |
| 44917.90625 | 7.87 |
| 44917.916666666664 | 7.87 |
| 44917.927083333336 | 7.87 |
| 44917.9375 | 7.87 |
| 44917.947916666664 | 7.87 |
| 44917.958333333336 | 7.87 |
| 44917.96875 | 7.87 |
| 44917.979166666664 | 7.87 |
| 44917.989583333336 | 7.88 |
| 44918.0 | 7.88 |
| 44918.010416666664 | 7.88 |
| 44918.020833333336 | 7.88 |
| 44918.03125 | 7.88 |
| 44918.041666666664 | 7.88 |
| 44918.052083333336 | 7.88 |
| 44918.0625 | 7.87 |
| 44918.072916666664 | 7.87 |
| 44918.083333333336 | 7.87 |
| 44918.09375 | 7.87 |
| 44918.104166666664 | 7.86 |
| 44918.114583333336 | 7.86 |
| 44918.125 | 7.86 |
| 44918.135416666664 | 7.85 |
| 44918.145833333336 | 7.84 |
| 44918.15625 | 7.84 |
| 44918.166666666664 | 7.83 |
| 44918.177083333336 | 7.82 |
| 44918.1875 | 7.82 |
| 44918.197916666664 | 7.8 |
| 44918.208333333336 | 7.8 |
| 44918.21875 | 7.8 |
| 44918.229166666664 | 7.8 |
| 44918.239583333336 | 7.8 |
| 44918.25 | 7.8 |
| 44918.260416666664 | 7.8 |
| 44918.270833333336 | 7.8 |
| 44918.28125 | 7.79 |
| 44918.291666666664 | 7.79 |
| 44918.302083333336 | 7.79 |
| 44918.3125 | 7.79 |
| 44918.322916666664 | 7.79 |
| 44918.333333333336 | 7.8 |
| 44918.34375 | 7.8 |
| 44918.354166666664 | 7.81 |
| 44918.364583333336 | 7.81 |
| 44918.375 | 7.81 |
| 44918.385416666664 | 7.81 |
| 44918.395833333336 | 7.81 |
| 44918.40625 | 7.81 |
| 44918.416666666664 | 7.8 |
| 44918.427083333336 | 7.81 |
| 44918.4375 | 7.81 |
| 44918.447916666664 | 7.82 |
| 44918.458333333336 | 7.82 |
| 44918.46875 | 7.82 |
| 44918.479166666664 | 7.82 |
| 44918.489583333336 | 7.82 |
| 44918.5 | 7.82 |
| 44918.510416666664 | 7.83 |
| 44918.520833333336 | 7.83 |
| 44918.53125 | 7.83 |
| 44918.541666666664 | 7.83 |
| 44918.552083333336 | 7.84 |
| 44918.5625 | 7.84 |
| 44918.572916666664 | 7.83 |
| 44918.583333333336 | 7.83 |
| 44918.59375 | 7.83 |
| 44918.604166666664 | 7.83 |
| 44918.614583333336 | 7.83 |
| 44918.625 | 7.83 |
| 44918.635416666664 | 7.83 |
| 44918.645833333336 | 7.83 |
| 44918.65625 | 7.82 |
| 44918.666666666664 | 7.82 |
| 44918.677083333336 | 7.82 |
| 44918.6875 | 7.81 |
| 44918.697916666664 | 7.81 |
| 44918.708333333336 | 7.81 |
| 44918.71875 | 7.8 |
| 44918.729166666664 | 7.8 |
| 44918.739583333336 | 7.8 |
| 44918.75 | 7.8 |
| 44918.760416666664 | 7.8 |
| 44918.770833333336 | 7.79 |
| 44918.78125 | 7.79 |
| 44918.791666666664 | 7.77 |
| 44918.802083333336 | 7.75 |
| 44918.8125 | 7.73 |
| 44918.822916666664 | 7.73 |
| 44918.833333333336 | 7.72 |
| 44918.84375 | 7.71 |
| 44918.854166666664 | 7.71 |
| 44918.864583333336 | 7.72 |
| 44918.875 | 7.71 |
| 44918.885416666664 | 7.71 |
| 44918.895833333336 | 7.72 |
| 44918.90625 | 7.74 |
| 44918.916666666664 | 7.76 |
| 44918.927083333336 | 7.76 |
| 44918.9375 | 7.77 |
| 44918.947916666664 | 7.77 |
| 44918.958333333336 | 7.78 |
| 44918.96875 | 7.78 |
| 44918.979166666664 | 7.78 |
| 44918.989583333336 | 7.78 |
| 44919.0 | 7.78 |
| 44919.010416666664 | 7.78 |
| 44919.020833333336 | 7.78 |
| 44919.03125 | 7.78 |
| 44919.041666666664 | 7.78 |
| 44919.052083333336 | 7.78 |
| 44919.0625 | 7.79 |
| 44919.072916666664 | 7.79 |
| 44919.083333333336 | 7.78 |
| 44919.09375 | 7.78 |
| 44919.104166666664 | 7.79 |
| 44919.114583333336 | 7.79 |
| 44919.125 | 7.79 |
| 44919.135416666664 | 7.79 |
| 44919.145833333336 | 7.79 |
| 44919.15625 | 7.78 |
| 44919.166666666664 | 7.79 |
| 44919.177083333336 | 7.78 |
| 44919.1875 | 7.78 |
| 44919.197916666664 | 7.77 |
| 44919.208333333336 | 7.76 |
| 44919.21875 | 7.75 |
| 44919.229166666664 | 7.75 |
| 44919.239583333336 | 7.74 |
| 44919.25 | 7.74 |
| 44919.260416666664 | 7.74 |
| 44919.270833333336 | 7.74 |
| 44919.28125 | 7.74 |
| 44919.291666666664 | 7.74 |
| 44919.302083333336 | 7.74 |
| 44919.3125 | 7.74 |
| 44919.322916666664 | 7.74 |
| 44919.333333333336 | 7.74 |
| 44919.34375 | 7.74 |
| 44919.354166666664 | 7.74 |
| 44919.364583333336 | 7.74 |
| 44919.375 | 7.74 |
| 44919.385416666664 | 7.74 |
| 44919.395833333336 | 7.75 |
| 44919.40625 | 7.77 |
| 44919.416666666664 | 7.78 |
| 44919.427083333336 | 7.78 |
| 44919.4375 | 7.79 |
| 44919.447916666664 | 7.79 |
| 44919.458333333336 | 7.79 |
| 44919.46875 | 7.79 |
| 44919.479166666664 | 7.8 |
| 44919.489583333336 | 7.81 |
| 44919.5 | 7.81 |
| 44919.510416666664 | 7.82 |
| 44919.520833333336 | 7.82 |
| 44919.53125 | 7.82 |
| 44919.541666666664 | 7.83 |
| 44919.552083333336 | 7.83 |
| 44919.5625 | 7.83 |
| 44919.572916666664 | 7.83 |
| 44919.583333333336 | 7.83 |
| 44919.59375 | 7.84 |
| 44919.604166666664 | 7.84 |
| 44919.614583333336 | 7.83 |
| 44919.625 | 7.83 |
| 44919.635416666664 | 7.83 |
| 44919.645833333336 | 7.83 |
| 44919.65625 | 7.83 |
| 44919.666666666664 | 7.83 |
| 44919.677083333336 | 7.82 |
| 44919.6875 | 7.82 |
| 44919.697916666664 | 7.82 |
| 44919.708333333336 | 7.81 |
| 44919.71875 | 7.81 |
| 44919.729166666664 | 7.81 |
| 44919.739583333336 | 7.79 |
| 44919.75 | 7.78 |
| 44919.760416666664 | 7.78 |
| 44919.770833333336 | 7.77 |
| 44919.78125 | 7.77 |
| 44919.791666666664 | 7.76 |
| 44919.802083333336 | 7.76 |
| 44919.8125 | 7.76 |
| 44919.822916666664 | 7.76 |
| 44919.833333333336 | 7.76 |
| 44919.84375 | 7.76 |
| 44919.854166666664 | 7.75 |
| 44919.864583333336 | 7.76 |
| 44919.875 | 7.76 |
| 44919.885416666664 | 7.76 |
| 44919.895833333336 | 7.76 |
| 44919.90625 | 7.76 |
| 44919.916666666664 | 7.76 |
| 44919.927083333336 | 7.76 |
| 44919.9375 | 7.77 |
| 44919.947916666664 | 7.78 |
| 44919.958333333336 | 7.79 |
| 44919.96875 | 7.8 |
| 44919.979166666664 | 7.8 |
| 44919.989583333336 | 7.8 |
| 44920.0 | 7.81 |
| 44920.010416666664 | 7.82 |
| 44920.020833333336 | 7.82 |
| 44920.03125 | 7.83 |
| 44920.041666666664 | 7.83 |
| 44920.052083333336 | 7.84 |
| 44920.0625 | 7.84 |
| 44920.072916666664 | 7.84 |
| 44920.083333333336 | 7.84 |
| 44920.09375 | 7.85 |
| 44920.104166666664 | 7.84 |
| 44920.114583333336 | 7.84 |
| 44920.125 | 7.84 |
| 44920.135416666664 | 7.84 |
| 44920.145833333336 | 7.84 |
| 44920.15625 | 7.84 |
| 44920.166666666664 | 7.84 |
| 44920.177083333336 | 7.83 |
| 44920.1875 | 7.83 |
| 44920.197916666664 | 7.81 |
| 44920.208333333336 | 7.8 |
| 44920.21875 | 7.79 |
| 44920.229166666664 | 7.79 |
| 44920.239583333336 | 7.78 |
| 44920.25 | 7.77 |
| 44920.260416666664 | 7.77 |
| 44920.270833333336 | 7.76 |
| 44920.28125 | 7.76 |
| 44920.291666666664 | 7.76 |
| 44920.302083333336 | 7.76 |
| 44920.3125 | 7.76 |
| 44920.322916666664 | 7.76 |
| 44920.333333333336 | 7.76 |
| 44920.34375 | 7.76 |
| 44920.354166666664 | 7.76 |
| 44920.364583333336 | 7.76 |
| 44920.375 | 7.76 |
| 44920.385416666664 | 7.75 |
| 44920.395833333336 | 7.76 |
| 44920.40625 | 7.76 |
| 44920.416666666664 | 7.76 |
| 44920.427083333336 | 7.77 |
| 44920.4375 | 7.77 |
| 44920.447916666664 | 7.78 |
| 44920.458333333336 | 7.79 |
| 44920.46875 | 7.8 |
| 44920.479166666664 | 7.8 |
| 44920.489583333336 | 7.8 |
| 44920.5 | 7.81 |
| 44920.510416666664 | 7.83 |
| 44920.520833333336 | 7.84 |
| 44920.53125 | 7.84 |
| 44920.541666666664 | 7.85 |
| 44920.552083333336 | 7.85 |
| 44920.5625 | 7.86 |
| 44920.572916666664 | 7.86 |
| 44920.583333333336 | 7.85 |
| 44920.59375 | 7.85 |
| 44920.604166666664 | 7.84 |
| 44920.614583333336 | 7.84 |
| 44920.625 | 7.84 |
| 44920.635416666664 | 7.84 |
| 44920.645833333336 | 7.83 |
| 44920.65625 | 7.84 |
| 44920.666666666664 | 7.84 |
| 44920.677083333336 | 7.84 |
| 44920.6875 | 7.84 |
| 44920.697916666664 | 7.84 |
| 44920.708333333336 | 7.84 |
| 44920.71875 | 7.83 |
| 44920.729166666664 | 7.83 |
| 44920.739583333336 | 7.83 |
| 44920.75 | 7.83 |
| 44920.760416666664 | 7.82 |
| 44920.770833333336 | 7.81 |
| 44920.78125 | 7.8 |
| 44920.791666666664 | 7.79 |
| 44920.802083333336 | 7.78 |
| 44920.8125 | 7.78 |
| 44920.822916666664 | 7.76 |
| 44920.833333333336 | 7.76 |
| 44920.84375 | 7.76 |
| 44920.854166666664 | 7.75 |
| 44920.864583333336 | 7.76 |
| 44920.875 | 7.75 |
| 44920.885416666664 | 7.76 |
| 44920.895833333336 | 7.76 |
| 44920.90625 | 7.76 |
| 44920.916666666664 | 7.75 |
| 44920.927083333336 | 7.76 |
| 44920.9375 | 7.76 |
| 44920.947916666664 | 7.76 |
| 44920.958333333336 | 7.77 |
| 44920.96875 | 7.78 |
| 44920.979166666664 | 7.78 |
| 44920.989583333336 | 7.79 |
| 44921.0 | 7.81 |
| 44921.010416666664 | 7.82 |
| 44921.020833333336 | 7.82 |
| 44921.03125 | 7.83 |
| 44921.041666666664 | 7.83 |
| 44921.052083333336 | 7.84 |
| 44921.0625 | 7.85 |
| 44921.072916666664 | 7.86 |
| 44921.083333333336 | 7.86 |
| 44921.09375 | 7.86 |
| 44921.104166666664 | 7.86 |
| 44921.114583333336 | 7.86 |
| 44921.125 | 7.87 |
| 44921.135416666664 | 7.86 |
| 44921.145833333336 | 7.87 |
| 44921.15625 | 7.86 |
| 44921.166666666664 | 7.86 |
| 44921.177083333336 | 7.86 |
| 44921.1875 | 7.86 |
| 44921.197916666664 | 7.86 |
| 44921.208333333336 | 7.86 |
| 44921.21875 | 7.86 |
| 44921.229166666664 | 7.85 |
| 44921.239583333336 | 7.84 |
| 44921.25 | 7.83 |
| 44921.260416666664 | 7.81 |
| 44921.270833333336 | 7.79 |
| 44921.28125 | 7.78 |
| 44921.291666666664 | 7.77 |
| 44921.302083333336 | 7.77 |
| 44921.3125 | 7.76 |
| 44921.322916666664 | 7.76 |
| 44921.333333333336 | 7.76 |
| 44921.34375 | 7.76 |
| 44921.354166666664 | 7.75 |
| 44921.364583333336 | 7.76 |
| 44921.375 | 7.75 |
| 44921.385416666664 | 7.76 |
| 44921.395833333336 | 7.75 |
| 44921.40625 | 7.75 |
| 44921.416666666664 | 7.75 |
| 44921.427083333336 | 7.76 |
| 44921.4375 | 7.76 |
| 44921.447916666664 | 7.76 |
| 44921.458333333336 | 7.76 |
| 44921.46875 | 7.77 |
| 44921.479166666664 | 7.78 |
| 44921.489583333336 | 7.8 |
| 44921.5 | 7.8 |
| 44921.510416666664 | 7.81 |
| 44921.520833333336 | 7.82 |
| 44921.53125 | 7.83 |
| 44921.541666666664 | 7.84 |
| 44921.552083333336 | 7.84 |
| 44921.5625 | 7.85 |
| 44921.572916666664 | 7.85 |
| 44921.583333333336 | 7.86 |
| 44921.59375 | 7.86 |
| 44921.604166666664 | 7.86 |
| 44921.614583333336 | 7.86 |
| 44921.625 | 7.85 |
| 44921.635416666664 | 7.85 |
| 44921.645833333336 | 7.85 |
| 44921.65625 | 7.85 |
| 44921.666666666664 | 7.85 |
| 44921.677083333336 | 7.85 |
| 44921.6875 | 7.85 |
| 44921.697916666664 | 7.85 |
| 44921.708333333336 | 7.85 |
| 44921.71875 | 7.85 |
| 44921.729166666664 | 7.85 |
| 44921.739583333336 | 7.85 |
| 44921.75 | 7.85 |
| 44921.760416666664 | 7.85 |
| 44921.770833333336 | 7.84 |
| 44921.78125 | 7.83 |
| 44921.791666666664 | 7.84 |
| 44921.802083333336 | 7.83 |
| 44921.8125 | 7.83 |
| 44921.822916666664 | 7.81 |
| 44921.833333333336 | 7.8 |
| 44921.84375 | 7.8 |
| 44921.854166666664 | 7.79 |
| 44921.864583333336 | 7.79 |
| 44921.875 | 7.78 |
| 44921.885416666664 | 7.78 |
| 44921.895833333336 | 7.78 |
| 44921.90625 | 7.78 |
| 44921.916666666664 | 7.78 |
| 44921.927083333336 | 7.79 |
| 44921.9375 | 7.78 |
| 44921.947916666664 | 7.79 |
| 44921.958333333336 | 7.79 |
| 44921.96875 | 7.78 |
| 44921.979166666664 | 7.78 |
| 44921.989583333336 | 7.79 |
| 44922.0 | 7.8 |
| 44922.010416666664 | 7.8 |
| 44922.020833333336 | 7.81 |
| 44922.03125 | 7.82 |
| 44922.041666666664 | 7.83 |
| 44922.052083333336 | 7.84 |
| 44922.0625 | 7.84 |
| 44922.072916666664 | 7.85 |
| 44922.083333333336 | 7.86 |
| 44922.09375 | 7.87 |
| 44922.104166666664 | 7.88 |
| 44922.114583333336 | 7.88 |
| 44922.125 | 7.88 |
| 44922.135416666664 | 7.88 |
| 44922.145833333336 | 7.89 |
| 44922.15625 | 7.89 |
| 44922.166666666664 | 7.89 |
| 44922.177083333336 | 7.89 |
| 44922.1875 | 7.88 |
| 44922.197916666664 | 7.88 |
| 44922.208333333336 | 7.88 |
| 44922.21875 | 7.88 |
| 44922.229166666664 | 7.88 |
| 44922.239583333336 | 7.88 |
| 44922.25 | 7.87 |
| 44922.260416666664 | 7.87 |
| 44922.270833333336 | 7.87 |
| 44922.28125 | 7.86 |
| 44922.291666666664 | 7.84 |
| 44922.302083333336 | 7.83 |
| 44922.3125 | 7.82 |
| 44922.322916666664 | 7.81 |
| 44922.333333333336 | 7.8 |
| 44922.34375 | 7.79 |
| 44922.354166666664 | 7.78 |
| 44922.364583333336 | 7.78 |
| 44922.375 | 7.77 |
| 44922.385416666664 | 7.77 |
| 44922.395833333336 | 7.76 |
| 44922.40625 | 7.76 |
| 44922.416666666664 | 7.76 |
| 44922.427083333336 | 7.76 |
| 44922.4375 | 7.76 |
| 44922.447916666664 | 7.76 |
| 44922.458333333336 | 7.77 |
| 44922.46875 | 7.77 |
| 44922.479166666664 | 7.77 |
| 44922.489583333336 | 7.77 |
| 44922.5 | 7.78 |
| 44922.510416666664 | 7.79 |
| 44922.520833333336 | 7.8 |
| 44922.53125 | 7.81 |
| 44922.541666666664 | 7.82 |
| 44922.552083333336 | 7.82 |
| 44922.5625 | 7.83 |
| 44922.572916666664 | 7.84 |
| 44922.583333333336 | 7.85 |
| 44922.59375 | 7.85 |
| 44922.604166666664 | 7.86 |
| 44922.614583333336 | 7.86 |
| 44922.625 | 7.87 |
| 44922.635416666664 | 7.88 |
| 44922.645833333336 | 7.88 |
| 44922.65625 | 7.87 |
| 44922.666666666664 | 7.87 |
| 44922.677083333336 | 7.87 |
| 44922.6875 | 7.87 |
| 44922.697916666664 | 7.87 |
| 44922.708333333336 | 7.87 |
| 44922.71875 | 7.86 |
| 44922.729166666664 | 7.86 |
| 44922.739583333336 | 7.87 |
| 44922.75 | 7.87 |
| 44922.760416666664 | 7.87 |
| 44922.770833333336 | 7.87 |
| 44922.78125 | 7.87 |
| 44922.791666666664 | 7.87 |
| 44922.802083333336 | 7.87 |
| 44922.8125 | 7.87 |
| 44922.822916666664 | 7.86 |
| 44922.833333333336 | 7.86 |
| 44922.84375 | 7.86 |
| 44922.854166666664 | 7.85 |
| 44922.864583333336 | 7.85 |
| 44922.875 | 7.84 |
| 44922.885416666664 | 7.83 |
| 44922.895833333336 | 7.82 |
| 44922.90625 | 7.82 |
| 44922.916666666664 | 7.82 |
| 44922.927083333336 | 7.81 |
| 44922.9375 | 7.81 |
| 44922.947916666664 | 7.81 |
| 44922.958333333336 | 7.81 |
| 44922.96875 | 7.81 |
| 44922.979166666664 | 7.81 |
| 44922.989583333336 | 7.81 |
| 44923.0 | 7.81 |
| 44923.010416666664 | 7.81 |
| 44923.020833333336 | 7.81 |
| 44923.03125 | 7.82 |
| 44923.041666666664 | 7.83 |
| 44923.052083333336 | 7.84 |
| 44923.0625 | 7.85 |
| 44923.072916666664 | 7.86 |
| 44923.083333333336 | 7.86 |
| 44923.09375 | 7.87 |
| 44923.104166666664 | 7.87 |
| 44923.114583333336 | 7.88 |
| 44923.125 | 7.88 |
| 44923.135416666664 | 7.88 |
| 44923.145833333336 | 7.89 |
| 44923.15625 | 7.89 |
| 44923.166666666664 | 7.9 |
| 44923.177083333336 | 7.9 |
| 44923.1875 | 7.9 |
| 44923.197916666664 | 7.91 |
| 44923.208333333336 | 7.91 |
| 44923.21875 | 7.91 |
| 44923.229166666664 | 7.9 |
| 44923.239583333336 | 7.9 |
| 44923.25 | 7.9 |
| 44923.260416666664 | 7.9 |
| 44923.270833333336 | 7.89 |
| 44923.28125 | 7.88 |
| 44923.291666666664 | 7.88 |
| 44923.302083333336 | 7.88 |
| 44923.3125 | 7.87 |
| 44923.322916666664 | 7.87 |
| 44923.333333333336 | 7.86 |
| 44923.34375 | 7.85 |
| 44923.354166666664 | 7.85 |
| 44923.364583333336 | 7.84 |
| 44923.375 | 7.83 |
| 44923.385416666664 | 7.82 |
| 44923.395833333336 | 7.81 |
| 44923.40625 | 7.81 |
| 44923.416666666664 | 7.8 |
| 44923.427083333336 | 7.8 |
| 44923.4375 | 7.8 |
| 44923.447916666664 | 7.79 |
| 44923.458333333336 | 7.79 |
| 44923.46875 | 7.79 |
| 44923.479166666664 | 7.79 |
| 44923.489583333336 | 7.79 |
| 44923.5 | 7.79 |
| 44923.510416666664 | 7.79 |
| 44923.520833333336 | 7.79 |
| 44923.53125 | 7.8 |
| 44923.541666666664 | 7.81 |
| 44923.552083333336 | 7.82 |
| 44923.5625 | 7.83 |
| 44923.572916666664 | 7.83 |
| 44923.583333333336 | 7.84 |
| 44923.59375 | 7.84 |
| 44923.604166666664 | 7.85 |
| 44923.614583333336 | 7.86 |
| 44923.625 | 7.87 |
| 44923.635416666664 | 7.87 |
| 44923.645833333336 | 7.88 |
| 44923.65625 | 7.88 |
| 44923.666666666664 | 7.89 |
| 44923.677083333336 | 7.89 |
| 44923.6875 | 7.9 |
| 44923.697916666664 | 7.9 |
| 44923.708333333336 | 7.9 |
| 44923.71875 | 7.9 |
| 44923.729166666664 | 7.9 |
| 44923.739583333336 | 7.9 |
| 44923.75 | 7.89 |
| 44923.760416666664 | 7.89 |
| 44923.770833333336 | 7.9 |
| 44923.78125 | 7.9 |
| 44923.791666666664 | 7.9 |
| 44923.802083333336 | 7.9 |
| 44923.8125 | 7.9 |
| 44923.822916666664 | 7.91 |
| 44923.833333333336 | 7.91 |
| 44923.84375 | 7.9 |
| 44923.854166666664 | 7.9 |
| 44923.864583333336 | 7.89 |
| 44923.875 | 7.89 |
| 44923.885416666664 | 7.88 |
| 44923.895833333336 | 7.87 |
| 44923.90625 | 7.86 |
| 44923.916666666664 | 7.85 |
| 44923.927083333336 | 7.85 |
| 44923.9375 | 7.84 |
| 44923.947916666664 | 7.84 |
| 44923.958333333336 | 7.84 |
| 44923.96875 | 7.84 |
| 44923.979166666664 | 7.84 |
| 44923.989583333336 | 7.84 |
| 44924.0 | 7.84 |
| 44924.010416666664 | 7.84 |
| 44924.020833333336 | 7.83 |
| 44924.03125 | 7.83 |
| 44924.041666666664 | 7.83 |
| 44924.052083333336 | 7.83 |
| 44924.0625 | 7.84 |
| 44924.072916666664 | 7.85 |
| 44924.083333333336 | 7.86 |
| 44924.09375 | 7.87 |
| 44924.104166666664 | 7.87 |
| 44924.114583333336 | 7.88 |
| 44924.125 | 7.88 |
| 44924.135416666664 | 7.88 |
| 44924.145833333336 | 7.89 |
| 44924.15625 | 7.89 |
| 44924.166666666664 | 7.9 |
| 44924.177083333336 | 7.9 |
| 44924.1875 | 7.91 |
| 44924.197916666664 | 7.91 |
| 44924.208333333336 | 7.91 |
| 44924.21875 | 7.92 |
| 44924.229166666664 | 7.92 |
| 44924.239583333336 | 7.92 |
| 44924.25 | 7.92 |
| 44924.260416666664 | 7.92 |
| 44924.270833333336 | 7.91 |
| 44924.28125 | 7.91 |
| 44924.291666666664 | 7.91 |
| 44924.302083333336 | 7.91 |
| 44924.3125 | 7.9 |
| 44924.322916666664 | 7.9 |
| 44924.333333333336 | 7.9 |
| 44924.34375 | 7.89 |
| 44924.354166666664 | 7.89 |
| 44924.364583333336 | 7.88 |
| 44924.375 | 7.87 |
| 44924.385416666664 | 7.87 |
| 44924.395833333336 | 7.86 |
| 44924.40625 | 7.85 |
| 44924.416666666664 | 7.84 |
| 44924.427083333336 | 7.84 |
| 44924.4375 | 7.83 |
| 44924.447916666664 | 7.82 |
| 44924.458333333336 | 7.82 |
| 44924.46875 | 7.81 |
| 44924.479166666664 | 7.81 |
| 44924.489583333336 | 7.81 |
| 44924.5 | 7.81 |
| 44924.510416666664 | 7.8 |
| 44924.520833333336 | 7.81 |
| 44924.53125 | 7.81 |
| 44924.541666666664 | 7.81 |
| 44924.552083333336 | 7.81 |
| 44924.5625 | 7.81 |
| 44924.572916666664 | 7.81 |
| 44924.583333333336 | 7.82 |
| 44924.59375 | 7.83 |
| 44924.604166666664 | 7.84 |
| 44924.614583333336 | 7.85 |
| 44924.625 | 7.85 |
| 44924.635416666664 | 7.86 |
| 44924.645833333336 | 7.87 |
| 44924.65625 | 7.87 |
| 44924.666666666664 | 7.88 |
| 44924.677083333336 | 7.89 |
| 44924.6875 | 7.89 |
| 44924.697916666664 | 7.9 |
| 44924.708333333336 | 7.9 |
| 44924.71875 | 7.91 |
| 44924.729166666664 | 7.91 |
| 44924.739583333336 | 7.91 |
| 44924.75 | 7.92 |
| 44924.760416666664 | 7.92 |
| 44924.770833333336 | 7.92 |
| 44924.78125 | 7.91 |
| 44924.791666666664 | 7.91 |
| 44924.802083333336 | 7.91 |
| 44924.8125 | 7.91 |
| 44924.822916666664 | 7.92 |
| 44924.833333333336 | 7.92 |
| 44924.84375 | 7.93 |
| 44924.854166666664 | 7.93 |
| 44924.864583333336 | 7.93 |
| 44924.875 | 7.93 |
| 44924.885416666664 | 7.93 |
| 44924.895833333336 | 7.92 |
| 44924.90625 | 7.91 |
| 44924.916666666664 | 7.9 |
| 44924.927083333336 | 7.89 |
| 44924.9375 | 7.89 |
| 44924.947916666664 | 7.88 |
| 44924.958333333336 | 7.88 |
| 44924.96875 | 7.88 |
| 44924.979166666664 | 7.88 |
| 44924.989583333336 | 7.87 |
| 44925.0 | 7.87 |
| 44925.010416666664 | 7.87 |
| 44925.020833333336 | 7.87 |
| 44925.03125 | 7.87 |
| 44925.041666666664 | 7.87 |
| 44925.052083333336 | 7.87 |
| 44925.0625 | 7.87 |
| 44925.072916666664 | 7.87 |
| 44925.083333333336 | 7.87 |
| 44925.09375 | 7.87 |
| 44925.104166666664 | 7.87 |
| 44925.114583333336 | 7.87 |
| 44925.125 | 7.88 |
| 44925.135416666664 | 7.88 |
| 44925.145833333336 | 7.88 |
| 44925.15625 | 7.89 |
| 44925.166666666664 | 7.89 |
| 44925.177083333336 | 7.9 |
| 44925.1875 | 7.9 |
| 44925.197916666664 | 7.91 |
| 44925.208333333336 | 7.91 |
| 44925.21875 | 7.91 |
| 44925.229166666664 | 7.92 |
| 44925.239583333336 | 7.92 |
| 44925.25 | 7.92 |
| 44925.260416666664 | 7.92 |
| 44925.270833333336 | 7.92 |
| 44925.28125 | 7.93 |
| 44925.291666666664 | 7.93 |
| 44925.302083333336 | 7.93 |
| 44925.3125 | 7.91 |
| 44925.322916666664 | 7.92 |
| 44925.333333333336 | 7.92 |
| 44925.34375 | 7.91 |
| 44925.354166666664 | 7.91 |
| 44925.364583333336 | 7.91 |
| 44925.375 | 7.9 |
| 44925.385416666664 | 7.9 |
| 44925.395833333336 | 7.9 |
| 44925.40625 | 7.89 |
| 44925.416666666664 | 7.88 |
| 44925.427083333336 | 7.88 |
| 44925.4375 | 7.87 |
| 44925.447916666664 | 7.87 |
| 44925.458333333336 | 7.86 |
| 44925.46875 | 7.85 |
| 44925.479166666664 | 7.85 |
| 44925.489583333336 | 7.84 |
| 44925.5 | 7.83 |
| 44925.510416666664 | 7.83 |
| 44925.520833333336 | 7.82 |
| 44925.53125 | 7.82 |
| 44925.541666666664 | 7.82 |
| 44925.552083333336 | 7.82 |
| 44925.5625 | 7.82 |
| 44925.572916666664 | 7.82 |
| 44925.583333333336 | 7.83 |
| 44925.59375 | 7.83 |
| 44925.604166666664 | 7.83 |
| 44925.614583333336 | 7.83 |
| 44925.625 | 7.85 |
| 44925.635416666664 | 7.86 |
| 44925.645833333336 | 7.87 |
| 44925.65625 | 7.88 |
| 44925.666666666664 | 7.88 |
| 44925.677083333336 | 7.89 |
| 44925.6875 | 7.89 |
| 44925.697916666664 | 7.9 |
| 44925.708333333336 | 7.9 |
| 44925.71875 | 7.91 |
| 44925.729166666664 | 7.91 |
| 44925.739583333336 | 7.92 |
| 44925.75 | 7.92 |
| 44925.760416666664 | 7.92 |
| 44925.770833333336 | 7.93 |
| 44925.78125 | 7.93 |
| 44925.791666666664 | 7.93 |
| 44925.802083333336 | 7.93 |
| 44925.8125 | 7.94 |
| 44925.822916666664 | 7.94 |
| 44925.833333333336 | 7.93 |
| 44925.84375 | 7.94 |
| 44925.854166666664 | 7.94 |
| 44925.864583333336 | 7.94 |
| 44925.875 | 7.95 |
| 44925.885416666664 | 7.95 |
| 44925.895833333336 | 7.95 |
| 44925.90625 | 7.94 |
| 44925.916666666664 | 7.94 |
| 44925.927083333336 | 7.94 |
| 44925.9375 | 7.94 |
| 44925.947916666664 | 7.94 |
| 44925.958333333336 | 7.93 |
| 44925.96875 | 7.92 |
| 44925.979166666664 | 7.92 |
| 44925.989583333336 | 7.91 |
| 44926.0 | 7.91 |
| 44926.010416666664 | 7.91 |
| 44926.020833333336 | 7.9 |
| 44926.03125 | 7.9 |
| 44926.041666666664 | 7.9 |
| 44926.052083333336 | 7.9 |
| 44926.0625 | 7.89 |
| 44926.072916666664 | 7.9 |
| 44926.083333333336 | 7.89 |
| 44926.09375 | 7.89 |
| 44926.104166666664 | 7.89 |
| 44926.114583333336 | 7.89 |
| 44926.125 | 7.89 |
| 44926.135416666664 | 7.9 |
| 44926.145833333336 | 7.9 |
| 44926.15625 | 7.91 |
| 44926.166666666664 | 7.91 |
| 44926.177083333336 | 7.91 |
| 44926.1875 | 7.91 |
| 44926.197916666664 | 7.91 |
| 44926.208333333336 | 7.91 |
| 44926.21875 | 7.92 |
| 44926.229166666664 | 7.92 |
| 44926.239583333336 | 7.92 |
| 44926.25 | 7.92 |
| 44926.260416666664 | 7.92 |
| 44926.270833333336 | 7.92 |
| 44926.28125 | 7.92 |
| 44926.291666666664 | 7.92 |
| 44926.302083333336 | 7.92 |
| 44926.3125 | 7.92 |
| 44926.322916666664 | 7.92 |
| 44926.333333333336 | 7.92 |
| 44926.34375 | 7.92 |
| 44926.354166666664 | 7.91 |
| 44926.364583333336 | 7.91 |
| 44926.375 | 7.91 |
| 44926.385416666664 | 7.91 |
| 44926.395833333336 | 7.91 |
| 44926.40625 | 7.9 |
| 44926.416666666664 | 7.9 |
| 44926.427083333336 | 7.89 |
| 44926.4375 | 7.9 |
| 44926.447916666664 | 7.89 |
| 44926.458333333336 | 7.88 |
| 44926.46875 | 7.85 |
| 44926.479166666664 | 7.85 |
| 44926.489583333336 | 7.86 |
| 44926.5 | 7.87 |
| 44926.510416666664 | 7.87 |
| 44926.520833333336 | 7.86 |
| 44926.53125 | 7.84 |
| 44926.541666666664 | 7.84 |
| 44926.552083333336 | 7.84 |
| 44926.5625 | 7.83 |
| 44926.572916666664 | 7.83 |
| 44926.583333333336 | 7.82 |
| 44926.59375 | 7.82 |
| 44926.604166666664 | 7.83 |
| 44926.614583333336 | 7.83 |
| 44926.625 | 7.83 |
| 44926.635416666664 | 7.84 |
| 44926.645833333336 | 7.84 |
| 44926.65625 | 7.84 |
| 44926.666666666664 | 7.85 |
| 44926.677083333336 | 7.85 |
| 44926.6875 | 7.86 |
| 44926.697916666664 | 7.87 |
| 44926.708333333336 | 7.88 |
| 44926.71875 | 7.89 |
| 44926.729166666664 | 7.89 |
| 44926.739583333336 | 7.89 |
| 44926.75 | 7.89 |
| 44926.760416666664 | 7.89 |
| 44926.770833333336 | 7.89 |
| 44926.78125 | 7.9 |
| 44926.791666666664 | 7.9 |
| 44926.802083333336 | 7.9 |
| 44926.8125 | 7.91 |
| 44926.822916666664 | 7.9 |
| 44926.833333333336 | 7.91 |
| 44926.84375 | 7.91 |
| 44926.854166666664 | 7.91 |
| 44926.864583333336 | 7.91 |
| 44926.875 | 7.9 |
| 44926.885416666664 | 7.9 |
| 44926.895833333336 | 7.91 |
| 44926.90625 | 7.91 |
| 44926.916666666664 | 7.9 |
| 44926.927083333336 | 7.9 |
| 44926.9375 | 7.9 |
| 44926.947916666664 | 7.89 |
| 44926.958333333336 | 7.88 |
| 44926.96875 | 7.86 |
| 44926.979166666664 | 7.86 |
| 44926.989583333336 | 7.87 |
| 44927.0 | 7.88 |
| 44927.010416666664 | 7.87 |
| 44927.020833333336 | 7.88 |
| 44927.03125 | 7.86 |
| 44927.041666666664 | 7.85 |
| 44927.052083333336 | 7.85 |
| 44927.0625 | 7.83 |
| 44927.072916666664 | 7.82 |
| 44927.083333333336 | 7.82 |
| 44927.09375 | 7.83 |
| 44927.104166666664 | 7.83 |
| 44927.114583333336 | 7.83 |
| 44927.125 | 7.84 |
| 44927.135416666664 | 7.84 |
| 44927.145833333336 | 7.84 |